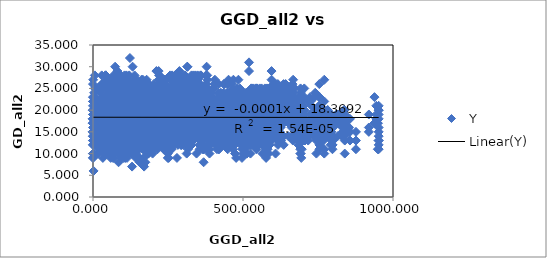
| Category | Y |
|---|---|
| 0.0 | 18 |
| 336.5924377441406 | 18 |
| 336.5924377441406 | 22 |
| 308.39825439453125 | 27 |
| 308.39825439453125 | 19 |
| 30.597917556762695 | 22 |
| 345.9538269042969 | 21 |
| 345.9538269042969 | 24 |
| 33.155311584472656 | 11 |
| 41.821807861328125 | 20 |
| 342.9433898925781 | 24 |
| 342.9433898925781 | 25 |
| 42.73628234863281 | 20 |
| 44.766014099121094 | 27 |
| 11.169123649597168 | 21 |
| 342.9433898925781 | 17 |
| 342.9433898925781 | 21 |
| 42.73628234863281 | 16 |
| 44.766014099121094 | 26 |
| 11.169123649597168 | 21 |
| 0.0 | 17 |
| 611.0723876953125 | 24 |
| 611.0723876953125 | 23 |
| 332.3634948730469 | 24 |
| 360.076904296875 | 28 |
| 352.108154296875 | 23 |
| 362.87445068359375 | 19 |
| 362.87445068359375 | 22 |
| 612.242919921875 | 25 |
| 612.242919921875 | 24 |
| 324.5494384765625 | 23 |
| 353.0105285644531 | 23 |
| 342.62835693359375 | 23 |
| 353.20623779296875 | 21 |
| 353.20623779296875 | 24 |
| 22.39409828186035 | 11 |
| 543.2648315429688 | 18 |
| 543.2648315429688 | 19 |
| 223.1958770751953 | 18 |
| 253.61122131347656 | 25 |
| 233.86766052246094 | 22 |
| 243.43594360351562 | 19 |
| 243.43594360351562 | 19 |
| 142.89517211914062 | 15 |
| 125.56082916259766 | 16 |
| 543.2648315429688 | 17 |
| 543.2648315429688 | 18 |
| 223.1958770751953 | 19 |
| 253.61122131347656 | 20 |
| 233.86766052246094 | 21 |
| 243.43594360351562 | 17 |
| 243.43594360351562 | 17 |
| 142.89517211914062 | 17 |
| 125.56082916259766 | 18 |
| 0.0 | 9 |
| 574.3759765625 | 20 |
| 574.3759765625 | 19 |
| 267.6763610839844 | 20 |
| 297.3863830566406 | 23 |
| 282.14044189453125 | 24 |
| 292.2620849609375 | 18 |
| 292.2620849609375 | 20 |
| 88.31727600097656 | 18 |
| 69.90605926513672 | 15 |
| 55.84099197387695 | 11 |
| 55.84099197387695 | 12 |
| 642.05908203125 | 26 |
| 642.05908203125 | 24 |
| 352.3686218261719 | 22 |
| 381.14630126953125 | 27 |
| 369.4870910644531 | 21 |
| 379.9279479980469 | 19 |
| 379.9279479980469 | 23 |
| 38.350563049316406 | 19 |
| 29.817731857299805 | 21 |
| 146.16342163085938 | 17 |
| 146.16342163085938 | 17 |
| 90.75834655761719 | 19 |
| 608.6643676757812 | 20 |
| 608.6643676757812 | 23 |
| 332.3789367675781 | 21 |
| 359.86883544921875 | 23 |
| 352.5760498046875 | 19 |
| 363.389404296875 | 22 |
| 363.389404296875 | 24 |
| 5.852751731872559 | 17 |
| 27.888471603393555 | 16 |
| 146.00103759765625 | 16 |
| 146.00103759765625 | 16 |
| 91.96529388427734 | 18 |
| 43.5916748046875 | 15 |
| 609.2371215820312 | 26 |
| 609.2371215820312 | 21 |
| 330.4605712890625 | 24 |
| 358.1661682128906 | 28 |
| 350.2300720214844 | 25 |
| 360.99969482421875 | 21 |
| 360.99969482421875 | 25 |
| 1.9184774160385132 | 14 |
| 21.97715950012207 | 18 |
| 141.40292358398438 | 12 |
| 141.40292358398438 | 19 |
| 86.96460723876953 | 17 |
| 39.50728225708008 | 17 |
| 5.912029266357422 | 18 |
| 611.0723876953125 | 22 |
| 611.0723876953125 | 18 |
| 332.3634948730469 | 20 |
| 360.076904296875 | 22 |
| 352.108154296875 | 20 |
| 362.87445068359375 | 19 |
| 362.87445068359375 | 18 |
| 0.0 | 13 |
| 22.39409828186035 | 17 |
| 142.89517211914062 | 9 |
| 142.89517211914062 | 13 |
| 88.31727600097656 | 15 |
| 38.350563049316406 | 13 |
| 5.852751731872559 | 17 |
| 1.9184774160385132 | 6 |
| 572.7981567382812 | 24 |
| 572.7981567382812 | 25 |
| 236.41485595703125 | 23 |
| 265.58087158203125 | 24 |
| 232.62648010253906 | 26 |
| 238.9027099609375 | 26 |
| 238.9027099609375 | 23 |
| 234.3833770751953 | 19 |
| 213.8500518798828 | 20 |
| 101.69757080078125 | 18 |
| 101.69757080078125 | 17 |
| 147.4093780517578 | 21 |
| 226.3685760498047 | 22 |
| 238.55789184570312 | 16 |
| 233.22406005859375 | 20 |
| 234.3833770751953 | 15 |
| 723.70703125 | 19 |
| 723.70703125 | 23 |
| 422.32989501953125 | 20 |
| 452.1468811035156 | 23 |
| 435.5972595214844 | 24 |
| 445.415283203125 | 20 |
| 445.415283203125 | 20 |
| 122.47817993164062 | 16 |
| 113.98316192626953 | 14 |
| 202.3887939453125 | 11 |
| 202.3887939453125 | 14 |
| 154.805419921875 | 15 |
| 85.31163787841797 | 18 |
| 127.00630950927734 | 13 |
| 123.90628051757812 | 16 |
| 122.47817993164062 | 15 |
| 255.14341735839844 | 17 |
| 667.1542358398438 | 27 |
| 667.1542358398438 | 24 |
| 350.2306213378906 | 24 |
| 380.6916198730469 | 28 |
| 359.5654602050781 | 25 |
| 368.7133483886719 | 24 |
| 368.7133483886719 | 25 |
| 122.78584289550781 | 17 |
| 102.06694793701172 | 19 |
| 127.1327896118164 | 12 |
| 127.1327896118164 | 19 |
| 95.36177062988281 | 18 |
| 91.9090347290039 | 16 |
| 128.6338348388672 | 15 |
| 122.97682189941406 | 14 |
| 122.78584289550781 | 12 |
| 166.32110595703125 | 18 |
| 88.96871185302734 | 19 |
| 653.59326171875 | 23 |
| 653.59326171875 | 22 |
| 332.6961975097656 | 23 |
| 363.2550354003906 | 25 |
| 340.6581726074219 | 26 |
| 349.5499267578125 | 21 |
| 349.5499267578125 | 24 |
| 133.3710479736328 | 21 |
| 111.45457458496094 | 20 |
| 110.867431640625 | 18 |
| 110.867431640625 | 18 |
| 88.5773696899414 | 17 |
| 106.9188232421875 | 20 |
| 139.10585021972656 | 15 |
| 133.24636840820312 | 16 |
| 133.3710479736328 | 19 |
| 142.9081573486328 | 20 |
| 112.4687271118164 | 14 |
| 23.50078582763672 | 17 |
| 659.8516235351562 | 20 |
| 659.8516235351562 | 17 |
| 372.1737976074219 | 22 |
| 400.8840637207031 | 25 |
| 389.39813232421875 | 24 |
| 399.84429931640625 | 16 |
| 399.84429931640625 | 21 |
| 50.79468536376953 | 17 |
| 48.46256637573242 | 17 |
| 165.4571533203125 | 13 |
| 165.4571533203125 | 12 |
| 110.3280258178711 | 13 |
| 19.920684814453125 | 17 |
| 54.84035873413086 | 15 |
| 52.400596618652344 | 16 |
| 50.79468536376953 | 14 |
| 242.9273681640625 | 20 |
| 72.61666870117188 | 16 |
| 99.00741577148438 | 16 |
| 116.92588806152344 | 12 |
| 693.3584594726562 | 23 |
| 693.3584594726562 | 22 |
| 437.2178649902344 | 21 |
| 463.622314453125 | 26 |
| 459.00390625 | 23 |
| 469.94384765625 | 22 |
| 469.94384765625 | 21 |
| 110.35126495361328 | 21 |
| 126.72693634033203 | 16 |
| 252.20260620117188 | 9 |
| 252.20260620117188 | 17 |
| 196.63275146484375 | 13 |
| 111.83654022216797 | 23 |
| 108.43370819091797 | 18 |
| 112.04568481445312 | 13 |
| 110.35126495361328 | 12 |
| 337.946533203125 | 22 |
| 134.55880737304688 | 17 |
| 194.45237731933594 | 16 |
| 213.79763793945312 | 19 |
| 97.39913177490234 | 15 |
| 561.1619873046875 | 23 |
| 561.1619873046875 | 23 |
| 229.56080627441406 | 22 |
| 259.9942932128906 | 25 |
| 232.9646453857422 | 26 |
| 241.0638885498047 | 20 |
| 241.0638885498047 | 23 |
| 185.60704040527344 | 20 |
| 165.79302978515625 | 20 |
| 51.640830993652344 | 12 |
| 51.640830993652344 | 17 |
| 97.74112701416016 | 15 |
| 180.89686584472656 | 19 |
| 189.5199432373047 | 20 |
| 184.3520965576172 | 17 |
| 185.60704040527344 | 13 |
| 50.61406707763672 | 19 |
| 220.37039184570312 | 18 |
| 134.38934326171875 | 19 |
| 112.54108428955078 | 17 |
| 198.5774688720703 | 18 |
| 291.4466857910156 | 19 |
| 606.0509643554688 | 22 |
| 606.0509643554688 | 17 |
| 287.7611999511719 | 25 |
| 318.20440673828125 | 22 |
| 297.6218566894531 | 27 |
| 306.94000244140625 | 24 |
| 306.94000244140625 | 23 |
| 116.803955078125 | 20 |
| 94.82061767578125 | 19 |
| 64.62254333496094 | 19 |
| 64.62254333496094 | 16 |
| 45.92457580566406 | 19 |
| 103.64509582519531 | 23 |
| 121.78163146972656 | 15 |
| 116.01081848144531 | 20 |
| 116.803955078125 | 16 |
| 122.98683166503906 | 16 |
| 141.82228088378906 | 19 |
| 62.5103759765625 | 22 |
| 47.83042526245117 | 19 |
| 119.94164276123047 | 15 |
| 215.45645141601562 | 21 |
| 80.38313293457031 | 21 |
| 594.499755859375 | 24 |
| 594.499755859375 | 19 |
| 264.7608642578125 | 24 |
| 295.2781982421875 | 23 |
| 268.955322265625 | 25 |
| 277.1459655761719 | 22 |
| 277.1459655761719 | 23 |
| 170.3186492919922 | 15 |
| 148.8640594482422 | 16 |
| 62.65382385253906 | 10 |
| 62.65382385253906 | 18 |
| 87.86018371582031 | 17 |
| 158.92840576171875 | 20 |
| 174.95962524414062 | 17 |
| 169.35304260253906 | 9 |
| 170.3186492919922 | 7 |
| 68.38549041748047 | 20 |
| 188.548828125 | 16 |
| 100.72956085205078 | 15 |
| 78.03026580810547 | 20 |
| 174.94383239746094 | 13 |
| 270.7470397949219 | 12 |
| 36.168548583984375 | 16 |
| 55.29109573364258 | 15 |
| 553.73828125 | 18 |
| 553.73828125 | 20 |
| 222.66285705566406 | 18 |
| 253.142333984375 | 25 |
| 226.6779327392578 | 21 |
| 234.93324279785156 | 20 |
| 234.93324279785156 | 18 |
| 184.12232971191406 | 16 |
| 164.7902069091797 | 17 |
| 46.809879302978516 | 10 |
| 46.809879302978516 | 11 |
| 95.88984680175781 | 13 |
| 181.04295349121094 | 16 |
| 187.85281372070312 | 14 |
| 182.80784606933594 | 13 |
| 184.12232971191406 | 10 |
| 54.909488677978516 | 16 |
| 223.3858184814453 | 16 |
| 138.3961944580078 | 12 |
| 117.03437805175781 | 16 |
| 199.08770751953125 | 12 |
| 290.95013427734375 | 15 |
| 7.8460612297058105 | 17 |
| 82.35458374023438 | 14 |
| 42.3043327331543 | 14 |
| 570.0089111328125 | 23 |
| 570.0089111328125 | 21 |
| 257.1239318847656 | 21 |
| 287.22308349609375 | 24 |
| 269.7819519042969 | 27 |
| 279.63177490234375 | 20 |
| 279.63177490234375 | 21 |
| 107.9359130859375 | 19 |
| 89.02912902832031 | 19 |
| 38.350528717041016 | 10 |
| 38.350528717041016 | 16 |
| 19.734533309936523 | 14 |
| 108.06942749023438 | 18 |
| 111.66101837158203 | 18 |
| 106.61154174804688 | 14 |
| 107.9359130859375 | 9 |
| 127.79035949707031 | 17 |
| 165.81735229492188 | 15 |
| 97.15308380126953 | 13 |
| 85.7076416015625 | 20 |
| 127.22042846679688 | 17 |
| 215.66665649414062 | 16 |
| 78.01134490966797 | 13 |
| 38.43940353393555 | 18 |
| 70.08003997802734 | 9 |
| 76.19879913330078 | 14 |
| 609.5515747070312 | 25 |
| 609.5515747070312 | 25 |
| 291.5254821777344 | 20 |
| 321.9632263183594 | 25 |
| 301.4199523925781 | 24 |
| 310.73956298828125 | 26 |
| 310.73956298828125 | 27 |
| 115.56438446044922 | 20 |
| 93.44818115234375 | 19 |
| 68.36766052246094 | 15 |
| 68.36766052246094 | 21 |
| 47.49314498901367 | 16 |
| 101.3092041015625 | 24 |
| 120.63333892822266 | 19 |
| 114.82595825195312 | 15 |
| 115.56438446044922 | 15 |
| 125.67058563232422 | 24 |
| 138.1477813720703 | 17 |
| 58.77418899536133 | 18 |
| 44.56229782104492 | 22 |
| 117.30209350585938 | 20 |
| 213.14569091796875 | 16 |
| 83.69881439208984 | 19 |
| 3.799713373184204 | 23 |
| 57.6868782043457 | 13 |
| 85.8255615234375 | 19 |
| 41.31404495239258 | 13 |
| 653.0517578125 | 24 |
| 653.0517578125 | 21 |
| 323.88702392578125 | 21 |
| 354.39361572265625 | 24 |
| 327.5762939453125 | 23 |
| 335.54754638671875 | 19 |
| 335.54754638671875 | 22 |
| 174.41783142089844 | 18 |
| 152.091796875 | 16 |
| 113.77238464355469 | 11 |
| 113.77238464355469 | 16 |
| 113.2616195678711 | 16 |
| 150.74114990234375 | 15 |
| 179.9801788330078 | 16 |
| 174.06893920898438 | 12 |
| 174.41783142089844 | 8 |
| 110.60018157958984 | 17 |
| 152.1744842529297 | 16 |
| 65.85067749023438 | 14 |
| 44.69692611694336 | 20 |
| 161.51528930664062 | 15 |
| 258.4888916015625 | 11 |
| 94.66969299316406 | 11 |
| 67.37959289550781 | 18 |
| 59.138790130615234 | 9 |
| 101.28446197509766 | 15 |
| 102.85202026367188 | 9 |
| 66.23735046386719 | 12 |
| 570.0089111328125 | 20 |
| 570.0089111328125 | 18 |
| 257.1239318847656 | 21 |
| 287.22308349609375 | 22 |
| 269.7819519042969 | 25 |
| 279.63177490234375 | 16 |
| 279.63177490234375 | 20 |
| 107.9359130859375 | 15 |
| 89.02912902832031 | 16 |
| 38.350528717041016 | 10 |
| 38.350528717041016 | 12 |
| 19.734533309936523 | 14 |
| 108.06942749023438 | 13 |
| 111.66101837158203 | 15 |
| 106.61154174804688 | 12 |
| 107.9359130859375 | 11 |
| 127.79035949707031 | 18 |
| 165.81735229492188 | 11 |
| 97.15308380126953 | 17 |
| 85.7076416015625 | 16 |
| 127.22042846679688 | 12 |
| 215.66665649414062 | 18 |
| 78.01134490966797 | 15 |
| 38.43940353393555 | 15 |
| 70.08003997802734 | 10 |
| 76.19879913330078 | 12 |
| 0.0 | 9 |
| 41.31404495239258 | 16 |
| 102.85202026367188 | 13 |
| 589.0814208984375 | 18 |
| 589.0814208984375 | 19 |
| 259.00091552734375 | 19 |
| 289.5057067871094 | 28 |
| 263.0496520996094 | 23 |
| 271.2200622558594 | 19 |
| 271.2200622558594 | 19 |
| 172.63613891601562 | 16 |
| 151.41151428222656 | 17 |
| 59.69709777832031 | 10 |
| 59.69709777832031 | 10 |
| 88.79448699951172 | 16 |
| 162.39878845214844 | 18 |
| 177.16160583496094 | 17 |
| 171.61769104003906 | 17 |
| 172.63613891601562 | 13 |
| 64.22086334228516 | 21 |
| 193.80580139160156 | 15 |
| 106.25639343261719 | 19 |
| 83.69831085205078 | 22 |
| 178.7398681640625 | 16 |
| 274.14044189453125 | 15 |
| 30.2147216796875 | 18 |
| 58.8289680480957 | 16 |
| 5.9598708152771 | 18 |
| 36.440006256103516 | 12 |
| 70.42095947265625 | 17 |
| 61.45502471923828 | 21 |
| 64.88789367675781 | 13 |
| 70.42095947265625 | 12 |
| 646.7122802734375 | 22 |
| 646.7122802734375 | 21 |
| 318.61297607421875 | 24 |
| 349.16290283203125 | 27 |
| 323.05474853515625 | 26 |
| 331.2064208984375 | 23 |
| 331.2064208984375 | 22 |
| 166.38294982910156 | 17 |
| 144.02220153808594 | 18 |
| 106.20567321777344 | 15 |
| 106.20567321777344 | 18 |
| 104.39730072021484 | 16 |
| 143.57568359375 | 21 |
| 171.9049835205078 | 18 |
| 165.99302673339844 | 15 |
| 166.38294982910156 | 15 |
| 110.0492172241211 | 19 |
| 149.05198669433594 | 19 |
| 61.260223388671875 | 17 |
| 38.88872146606445 | 17 |
| 154.9583740234375 | 15 |
| 252.1632080078125 | 16 |
| 90.14495849609375 | 21 |
| 58.5109977722168 | 14 |
| 54.10598373413086 | 14 |
| 96.40737915039062 | 10 |
| 94.15133666992188 | 18 |
| 57.37913131713867 | 22 |
| 8.8689603805542 | 18 |
| 94.15133666992188 | 15 |
| 60.005123138427734 | 16 |
| 580.0127563476562 | 22 |
| 580.0127563476562 | 25 |
| 250.57498168945312 | 21 |
| 281.1150817871094 | 28 |
| 255.25814819335938 | 24 |
| 263.5881652832031 | 18 |
| 263.5881652832031 | 19 |
| 169.8580780029297 | 17 |
| 149.07627868652344 | 20 |
| 50.88556671142578 | 16 |
| 50.88556671142578 | 17 |
| 84.2339859008789 | 17 |
| 161.71243286132812 | 20 |
| 174.1832275390625 | 20 |
| 168.75450134277344 | 22 |
| 169.8580780029297 | 18 |
| 64.89379119873047 | 23 |
| 197.2684326171875 | 20 |
| 110.8101806640625 | 20 |
| 88.88898468017578 | 16 |
| 178.66456604003906 | 18 |
| 273.1334228515625 | 21 |
| 23.65210723876953 | 15 |
| 59.01826095581055 | 21 |
| 14.493782997131348 | 20 |
| 28.724950790405273 | 15 |
| 65.19802856445312 | 17 |
| 62.043338775634766 | 22 |
| 73.44851684570312 | 18 |
| 65.19802856445312 | 17 |
| 9.518770217895508 | 19 |
| 68.06269073486328 | 14 |
| 570.0089111328125 | 20 |
| 570.0089111328125 | 21 |
| 257.1239318847656 | 22 |
| 287.22308349609375 | 23 |
| 269.7819519042969 | 24 |
| 279.63177490234375 | 18 |
| 279.63177490234375 | 21 |
| 107.9359130859375 | 12 |
| 89.02912902832031 | 15 |
| 38.350528717041016 | 14 |
| 38.350528717041016 | 17 |
| 19.734533309936523 | 13 |
| 108.06942749023438 | 17 |
| 111.66101837158203 | 13 |
| 106.61154174804688 | 14 |
| 107.9359130859375 | 14 |
| 127.79035949707031 | 16 |
| 165.81735229492188 | 15 |
| 97.15308380126953 | 18 |
| 85.7076416015625 | 19 |
| 127.22042846679688 | 14 |
| 215.66665649414062 | 16 |
| 78.01134490966797 | 15 |
| 38.43940353393555 | 15 |
| 70.08003997802734 | 14 |
| 76.19879913330078 | 15 |
| 0.0 | 17 |
| 41.31404495239258 | 20 |
| 102.85202026367188 | 15 |
| 0.0 | 15 |
| 70.42095947265625 | 16 |
| 94.15133666992188 | 12 |
| 65.19802856445312 | 19 |
| 635.2426147460938 | 26 |
| 635.2426147460938 | 21 |
| 322.1102294921875 | 25 |
| 352.3760070800781 | 20 |
| 333.29058837890625 | 22 |
| 342.8126220703125 | 19 |
| 342.8126220703125 | 20 |
| 99.09312438964844 | 19 |
| 76.9604263305664 | 16 |
| 99.43075561523438 | 15 |
| 99.43075561523438 | 15 |
| 61.907997131347656 | 16 |
| 75.82059478759766 | 18 |
| 104.76040649414062 | 18 |
| 98.8694839477539 | 16 |
| 99.09312438964844 | 12 |
| 156.7611846923828 | 20 |
| 104.47672271728516 | 19 |
| 33.75407028198242 | 19 |
| 34.840328216552734 | 20 |
| 88.91642761230469 | 17 |
| 186.2243194580078 | 14 |
| 117.10171508789062 | 20 |
| 37.38433074951172 | 16 |
| 88.40125274658203 | 12 |
| 119.50394439697266 | 16 |
| 65.84796142578125 | 17 |
| 33.76450729370117 | 22 |
| 75.76177978515625 | 16 |
| 65.84796142578125 | 15 |
| 92.93107604980469 | 18 |
| 68.14555358886719 | 14 |
| 94.7896957397461 | 21 |
| 65.84796142578125 | 13 |
| 607.6777954101562 | 23 |
| 607.6777954101562 | 20 |
| 272.611328125 | 21 |
| 302.4283447265625 | 23 |
| 271.41180419921875 | 22 |
| 278.2763366699219 | 14 |
| 278.2763366699219 | 20 |
| 213.61000061035156 | 14 |
| 191.84727478027344 | 12 |
| 100.17379760742188 | 14 |
| 100.17379760742188 | 12 |
| 132.00807189941406 | 12 |
| 199.67462158203125 | 19 |
| 218.40101623535156 | 18 |
| 212.7199249267578 | 19 |
| 213.61000061035156 | 16 |
| 42.456417083740234 | 21 |
| 218.36111450195312 | 14 |
| 129.5347900390625 | 20 |
| 106.09349822998047 | 19 |
| 214.4380340576172 | 15 |
| 311.3235168457031 | 16 |
| 53.675758361816406 | 16 |
| 97.16362762451172 | 18 |
| 44.166587829589844 | 18 |
| 61.35895538330078 | 14 |
| 113.96250915527344 | 17 |
| 98.92198944091797 | 20 |
| 69.4442367553711 | 15 |
| 113.96250915527344 | 11 |
| 43.61764144897461 | 11 |
| 70.15608978271484 | 19 |
| 50.36499786376953 | 17 |
| 113.96250915527344 | 16 |
| 125.8056869506836 | 16 |
| 525.6075439453125 | 20 |
| 525.6075439453125 | 21 |
| 205.86087036132812 | 20 |
| 236.21942138671875 | 24 |
| 217.242919921875 | 23 |
| 226.9675750732422 | 21 |
| 226.9675750732422 | 20 |
| 151.861083984375 | 18 |
| 136.13499450683594 | 15 |
| 17.73990249633789 | 12 |
| 17.73990249633789 | 15 |
| 67.98746490478516 | 12 |
| 158.6945037841797 | 21 |
| 154.4351806640625 | 17 |
| 150.2509307861328 | 12 |
| 151.861083984375 | 11 |
| 105.15824127197266 | 21 |
| 218.47584533691406 | 13 |
| 144.68292236328125 | 19 |
| 128.60598754882812 | 18 |
| 178.31126403808594 | 16 |
| 262.0119323730469 | 11 |
| 58.06940460205078 | 20 |
| 82.18962860107422 | 18 |
| 76.68650817871094 | 11 |
| 51.51184844970703 | 15 |
| 52.91740798950195 | 14 |
| 85.91063690185547 | 11 |
| 130.3748779296875 | 13 |
| 52.91740798950195 | 14 |
| 72.90557861328125 | 16 |
| 123.04930877685547 | 16 |
| 63.5572395324707 | 18 |
| 52.91740798950195 | 17 |
| 116.36531829833984 | 16 |
| 110.27876281738281 | 15 |
| 651.5767822265625 | 25 |
| 651.5767822265625 | 22 |
| 326.6238708496094 | 24 |
| 357.2212829589844 | 26 |
| 332.736083984375 | 25 |
| 341.24658203125 | 22 |
| 341.24658203125 | 23 |
| 151.1294708251953 | 18 |
| 128.92478942871094 | 16 |
| 108.57020568847656 | 14 |
| 108.57020568847656 | 19 |
| 96.83658599853516 | 17 |
| 126.39307403564453 | 21 |
| 156.77162170410156 | 21 |
| 150.87193298339844 | 14 |
| 151.1294708251953 | 13 |
| 126.43389129638672 | 23 |
| 130.6720428466797 | 16 |
| 42.485984802246094 | 19 |
| 20.26102066040039 | 21 |
| 136.9917449951172 | 21 |
| 233.9896240234375 | 14 |
| 101.18968200683594 | 16 |
| 51.77055358886719 | 20 |
| 65.26911163330078 | 12 |
| 106.6317138671875 | 16 |
| 89.88280487060547 | 15 |
| 49.55082321166992 | 15 |
| 24.523605346679688 | 13 |
| 89.88280487060547 | 12 |
| 71.19898223876953 | 14 |
| 18.805984497070312 | 16 |
| 77.91400909423828 | 21 |
| 89.88280487060547 | 16 |
| 52.06651306152344 | 12 |
| 87.85272979736328 | 12 |
| 126.08879089355469 | 16 |
| 289.9646301269531 | 23 |
| 289.9646301269531 | 18 |
| 119.6859130859375 | 21 |
| 96.41453552246094 | 25 |
| 99.76162719726562 | 24 |
| 89.74176788330078 | 19 |
| 89.74176788330078 | 20 |
| 450.8919982910156 | 16 |
| 442.0020446777344 | 15 |
| 333.1093444824219 | 13 |
| 333.1093444824219 | 17 |
| 381.8962097167969 | 14 |
| 469.0888366699219 | 16 |
| 451.14495849609375 | 16 |
| 449.00128173828125 | 11 |
| 450.8919982910156 | 13 |
| 321.48480224609375 | 18 |
| 535.1554565429688 | 17 |
| 457.9532775878906 | 15 |
| 438.425048828125 | 17 |
| 488.9897155761719 | 13 |
| 556.66064453125 | 13 |
| 328.6156005859375 | 18 |
| 396.40380859375 | 17 |
| 364.78387451171875 | 11 |
| 322.8314208984375 | 14 |
| 369.37322998046875 | 16 |
| 400.2032775878906 | 19 |
| 422.52337646484375 | 15 |
| 369.37322998046875 | 12 |
| 358.8301086425781 | 14 |
| 418.6270751953125 | 11 |
| 351.55548095703125 | 19 |
| 369.37322998046875 | 11 |
| 432.4387512207031 | 12 |
| 362.3876037597656 | 16 |
| 316.6993713378906 | 11 |
| 429.4329833984375 | 14 |
| 704.2862548828125 | 25 |
| 704.2862548828125 | 23 |
| 442.1230163574219 | 21 |
| 469.0804443359375 | 22 |
| 462.9532470703125 | 23 |
| 473.803466796875 | 19 |
| 473.803466796875 | 24 |
| 111.55754089355469 | 19 |
| 125.5006103515625 | 14 |
| 250.82630920410156 | 16 |
| 250.82630920410156 | 19 |
| 194.99649047851562 | 17 |
| 106.99103546142578 | 18 |
| 110.53520202636719 | 17 |
| 113.3713150024414 | 16 |
| 111.55754089355469 | 14 |
| 333.1778259277344 | 13 |
| 119.79439544677734 | 18 |
| 184.6762237548828 | 16 |
| 204.95989990234375 | 19 |
| 90.51968383789062 | 19 |
| 17.497316360473633 | 17 |
| 287.8363037109375 | 17 |
| 210.23623657226562 | 18 |
| 265.3750915527344 | 14 |
| 287.804931640625 | 16 |
| 213.51991271972656 | 13 |
| 207.69525146484375 | 17 |
| 249.60205078125 | 10 |
| 213.51991271972656 | 15 |
| 269.065185546875 | 18 |
| 243.6640625 | 17 |
| 268.6473693847656 | 18 |
| 213.51991271972656 | 18 |
| 179.17018127441406 | 17 |
| 304.88531494140625 | 17 |
| 261.619140625 | 17 |
| 225.21905517578125 | 14 |
| 561.2374267578125 | 16 |
| 605.0715942382812 | 24 |
| 605.0715942382812 | 20 |
| 325.7366943359375 | 23 |
| 353.4583740234375 | 23 |
| 345.4945983886719 | 23 |
| 356.26470947265625 | 20 |
| 356.26470947265625 | 19 |
| 6.627439975738525 | 17 |
| 20.719097137451172 | 17 |
| 137.23348999023438 | 14 |
| 137.23348999023438 | 16 |
| 83.0942153930664 | 14 |
| 41.86090850830078 | 18 |
| 8.875386238098145 | 18 |
| 4.735645771026611 | 17 |
| 6.627439975738525 | 13 |
| 229.70846557617188 | 23 |
| 126.81713104248047 | 18 |
| 122.6402587890625 | 20 |
| 132.128173828125 | 21 |
| 55.90811538696289 | 15 |
| 116.59626007080078 | 15 |
| 180.64576721191406 | 19 |
| 113.33856201171875 | 18 |
| 166.2671661376953 | 14 |
| 178.98023986816406 | 14 |
| 102.7870864868164 | 16 |
| 112.27942657470703 | 18 |
| 172.38946533203125 | 14 |
| 102.7870864868164 | 12 |
| 168.41574096679688 | 16 |
| 164.22068786621094 | 17 |
| 165.369873046875 | 17 |
| 102.7870864868164 | 16 |
| 97.55188751220703 | 17 |
| 209.7883758544922 | 12 |
| 145.86453247070312 | 11 |
| 149.421875 | 16 |
| 444.26739501953125 | 12 |
| 118.06781768798828 | 18 |
| 724.9541015625 | 22 |
| 724.9541015625 | 15 |
| 435.760009765625 | 26 |
| 464.8211975097656 | 25 |
| 451.76251220703125 | 27 |
| 462.0108947753906 | 24 |
| 462.0108947753906 | 19 |
| 114.22824096679688 | 22 |
| 113.76560974121094 | 22 |
| 222.6132354736328 | 14 |
| 222.6132354736328 | 17 |
| 169.9840545654297 | 20 |
| 84.33038330078125 | 19 |
| 117.212890625 | 19 |
| 116.01203918457031 | 17 |
| 114.22824096679688 | 12 |
| 287.0026550292969 | 22 |
| 42.73221969604492 | 20 |
| 123.97755432128906 | 18 |
| 146.98052978515625 | 21 |
| 65.39591979980469 | 15 |
| 94.92545318603516 | 19 |
| 248.0193634033203 | 18 |
| 167.69546508789062 | 15 |
| 218.9905242919922 | 12 |
| 249.9898681640625 | 16 |
| 184.4859619140625 | 13 |
| 164.32559204101562 | 20 |
| 189.40333557128906 | 11 |
| 184.4859619140625 | 14 |
| 223.77923583984375 | 16 |
| 185.2286834716797 | 19 |
| 225.8919677734375 | 20 |
| 184.4859619140625 | 18 |
| 131.10247802734375 | 16 |
| 252.697998046875 | 19 |
| 237.16978454589844 | 18 |
| 166.46353149414062 | 16 |
| 551.5101928710938 | 16 |
| 79.01498413085938 | 18 |
| 120.02198791503906 | 16 |
| 308.1032409667969 | 20 |
| 308.1032409667969 | 23 |
| 100.87713623046875 | 23 |
| 81.37201690673828 | 26 |
| 77.74834442138672 | 26 |
| 67.24243927001953 | 21 |
| 67.24243927001953 | 22 |
| 429.7846374511719 | 20 |
| 420.3728942871094 | 14 |
| 310.0333557128906 | 16 |
| 310.0333557128906 | 15 |
| 359.42218017578125 | 17 |
| 447.16339111328125 | 19 |
| 430.1936340332031 | 17 |
| 427.9031982421875 | 23 |
| 429.7846374511719 | 18 |
| 297.4061584472656 | 19 |
| 512.2550048828125 | 15 |
| 434.4705810546875 | 22 |
| 414.7928771972656 | 19 |
| 467.0787048339844 | 14 |
| 536.3073120117188 | 19 |
| 304.7280578613281 | 20 |
| 373.07720947265625 | 16 |
| 340.89605712890625 | 20 |
| 299.0003356933594 | 15 |
| 346.5584716796875 | 20 |
| 376.87554931640625 | 25 |
| 398.5430908203125 | 19 |
| 346.5584716796875 | 14 |
| 334.94012451171875 | 15 |
| 394.69622802734375 | 18 |
| 327.72515869140625 | 20 |
| 346.5584716796875 | 15 |
| 409.2636413574219 | 20 |
| 338.2978210449219 | 15 |
| 293.7820739746094 | 21 |
| 405.6218566894531 | 17 |
| 24.089969635009766 | 18 |
| 540.4954223632812 | 16 |
| 423.1675720214844 | 15 |
| 529.2259521484375 | 22 |
| 632.2920532226562 | 21 |
| 632.2920532226562 | 22 |
| 318.25933837890625 | 23 |
| 348.5621643066406 | 27 |
| 329.18731689453125 | 25 |
| 338.6674499511719 | 27 |
| 338.6674499511719 | 23 |
| 101.77978515625 | 23 |
| 79.51608276367188 | 22 |
| 95.37606048583984 | 19 |
| 95.37606048583984 | 16 |
| 59.78857421875 | 20 |
| 79.70125579833984 | 23 |
| 107.38678741455078 | 16 |
| 101.48096466064453 | 23 |
| 101.77978515625 | 19 |
| 152.04139709472656 | 20 |
| 109.04631805419922 | 21 |
| 35.58433151245117 | 25 |
| 33.41533660888672 | 18 |
| 93.22383880615234 | 19 |
| 190.45016479492188 | 18 |
| 112.35050964355469 | 21 |
| 32.77627182006836 | 16 |
| 83.67186737060547 | 22 |
| 114.79032897949219 | 17 |
| 62.51683807373047 | 24 |
| 29.11825180053711 | 26 |
| 72.70023345947266 | 22 |
| 62.51683807373047 | 20 |
| 88.17868041992188 | 14 |
| 64.86341094970703 | 18 |
| 90.01947021484375 | 21 |
| 62.51683807373047 | 17 |
| 4.770721435546875 | 19 |
| 121.33746337890625 | 20 |
| 112.43614959716797 | 20 |
| 49.44524383544922 | 21 |
| 428.26409912109375 | 19 |
| 183.5722198486328 | 23 |
| 99.9792251586914 | 21 |
| 135.87290954589844 | 22 |
| 405.0535583496094 | 18 |
| 676.513916015625 | 20 |
| 676.513916015625 | 20 |
| 352.9137268066406 | 21 |
| 383.51080322265625 | 21 |
| 359.3475036621094 | 25 |
| 367.89605712890625 | 20 |
| 367.89605712890625 | 19 |
| 153.79714965820312 | 21 |
| 132.52757263183594 | 17 |
| 133.25343322753906 | 13 |
| 133.25343322753906 | 10 |
| 113.99483489990234 | 12 |
| 123.88462829589844 | 20 |
| 159.6219024658203 | 16 |
| 153.87339782714844 | 20 |
| 153.79714965820312 | 15 |
| 150.94129943847656 | 15 |
| 111.48706817626953 | 15 |
| 32.03303909301758 | 16 |
| 25.42270278930664 | 15 |
| 130.84878540039062 | 13 |
| 225.5166015625 | 16 |
| 127.85063934326172 | 19 |
| 72.24004364013672 | 16 |
| 91.8514633178711 | 18 |
| 133.32736206054688 | 12 |
| 110.53080749511719 | 15 |
| 69.2192611694336 | 21 |
| 41.70465850830078 | 17 |
| 110.53080749511719 | 13 |
| 97.79638671875 | 18 |
| 40.89262008666992 | 17 |
| 104.60874938964844 | 18 |
| 110.53080749511719 | 16 |
| 58.15249252319336 | 18 |
| 110.72018432617188 | 17 |
| 150.935546875 | 17 |
| 26.69574737548828 | 20 |
| 456.12481689453125 | 17 |
| 215.1175537109375 | 18 |
| 153.22860717773438 | 18 |
| 150.267333984375 | 17 |
| 432.3166198730469 | 14 |
| 57.66340637207031 | 20 |
| 577.3297729492188 | 24 |
| 577.3297729492188 | 19 |
| 241.0909881591797 | 27 |
| 270.3910217285156 | 27 |
| 237.78981018066406 | 27 |
| 244.18377685546875 | 25 |
| 244.18377685546875 | 20 |
| 230.5709686279297 | 26 |
| 209.85601806640625 | 23 |
| 99.80443572998047 | 19 |
| 99.80443572998047 | 16 |
| 144.03265380859375 | 19 |
| 221.8399658203125 | 23 |
| 234.82733154296875 | 22 |
| 229.44293212890625 | 25 |
| 230.5709686279297 | 20 |
| 6.048202991485596 | 28 |
| 249.53648376464844 | 24 |
| 160.66403198242188 | 26 |
| 137.22511291503906 | 22 |
| 238.21044921875 | 19 |
| 333.5183410644531 | 20 |
| 48.27854537963867 | 21 |
| 118.31144714355469 | 20 |
| 63.400550842285156 | 22 |
| 53.27190399169922 | 19 |
| 124.50663757324219 | 24 |
| 120.91043090820312 | 28 |
| 104.58120727539062 | 21 |
| 124.50663757324219 | 20 |
| 59.482635498046875 | 16 |
| 104.0997085571289 | 16 |
| 60.779850006103516 | 15 |
| 124.50663757324219 | 22 |
| 151.65745544433594 | 19 |
| 36.443355560302734 | 18 |
| 104.2557144165039 | 19 |
| 120.58959197998047 | 23 |
| 327.09051513671875 | 18 |
| 328.5474853515625 | 24 |
| 225.9936981201172 | 17 |
| 281.6666564941406 | 17 |
| 303.0071105957031 | 22 |
| 146.95367431640625 | 17 |
| 144.99208068847656 | 22 |
| 624.632568359375 | 25 |
| 624.632568359375 | 21 |
| 289.6075134277344 | 23 |
| 316.48602294921875 | 27 |
| 278.97332763671875 | 25 |
| 282.99981689453125 | 17 |
| 282.99981689453125 | 22 |
| 294.95941162109375 | 19 |
| 273.1996765136719 | 20 |
| 173.02337646484375 | 15 |
| 173.02337646484375 | 17 |
| 212.1863555908203 | 16 |
| 280.30645751953125 | 23 |
| 299.7294616699219 | 21 |
| 294.06048583984375 | 21 |
| 294.95941162109375 | 19 |
| 73.95741271972656 | 25 |
| 290.5296936035156 | 21 |
| 203.92404174804688 | 23 |
| 181.36500549316406 | 16 |
| 294.32977294921875 | 17 |
| 391.58514404296875 | 22 |
| 121.45421600341797 | 15 |
| 178.46751403808594 | 22 |
| 124.99163818359375 | 20 |
| 127.1347885131836 | 20 |
| 193.43992614746094 | 20 |
| 180.12472534179688 | 26 |
| 138.53855895996094 | 21 |
| 193.43992614746094 | 17 |
| 123.45052337646484 | 20 |
| 142.6842803955078 | 22 |
| 128.28355407714844 | 20 |
| 193.43992614746094 | 17 |
| 205.41334533691406 | 22 |
| 81.35597229003906 | 19 |
| 178.3921356201172 | 22 |
| 161.4877166748047 | 23 |
| 356.3956298828125 | 20 |
| 384.439208984375 | 23 |
| 291.0962829589844 | 19 |
| 327.8313903808594 | 21 |
| 332.94189453125 | 19 |
| 201.14047241210938 | 19 |
| 179.16244506835938 | 17 |
| 74.17814636230469 | 20 |
| 308.1032409667969 | 25 |
| 308.1032409667969 | 23 |
| 100.87713623046875 | 23 |
| 81.37201690673828 | 29 |
| 77.74834442138672 | 28 |
| 67.24243927001953 | 19 |
| 67.24243927001953 | 25 |
| 429.7846374511719 | 23 |
| 420.3728942871094 | 21 |
| 310.0333557128906 | 18 |
| 310.0333557128906 | 20 |
| 359.42218017578125 | 17 |
| 447.16339111328125 | 24 |
| 430.1936340332031 | 20 |
| 427.9031982421875 | 22 |
| 429.7846374511719 | 22 |
| 297.4061584472656 | 23 |
| 512.2550048828125 | 22 |
| 434.4705810546875 | 22 |
| 414.7928771972656 | 15 |
| 467.0787048339844 | 17 |
| 536.3073120117188 | 16 |
| 304.7280578613281 | 18 |
| 373.07720947265625 | 19 |
| 340.89605712890625 | 21 |
| 299.0003356933594 | 19 |
| 346.5584716796875 | 21 |
| 376.87554931640625 | 26 |
| 398.5430908203125 | 20 |
| 346.5584716796875 | 17 |
| 334.94012451171875 | 18 |
| 394.69622802734375 | 19 |
| 327.72515869140625 | 19 |
| 346.5584716796875 | 19 |
| 409.2636413574219 | 21 |
| 338.2978210449219 | 15 |
| 293.7820739746094 | 21 |
| 405.6218566894531 | 20 |
| 24.089969635009766 | 17 |
| 540.4954223632812 | 18 |
| 423.1675720214844 | 22 |
| 529.2259521484375 | 24 |
| 0.0 | 20 |
| 405.0535583496094 | 17 |
| 432.3166198730469 | 18 |
| 303.0071105957031 | 19 |
| 332.94189453125 | 18 |
| 754.3591918945312 | 23 |
| 754.3591918945312 | 23 |
| 455.0025329589844 | 24 |
| 484.7658996582031 | 21 |
| 468.41375732421875 | 23 |
| 478.2410583496094 | 18 |
| 478.2410583496094 | 23 |
| 148.3187255859375 | 21 |
| 142.7567596435547 | 17 |
| 235.20913696289062 | 19 |
| 235.20913696289062 | 15 |
| 187.38137817382812 | 17 |
| 113.19035339355469 | 21 |
| 152.23812866210938 | 19 |
| 149.9208984375 | 21 |
| 148.3187255859375 | 18 |
| 285.5185241699219 | 20 |
| 32.831363677978516 | 16 |
| 119.2886734008789 | 24 |
| 142.62008666992188 | 18 |
| 97.52442169189453 | 16 |
| 136.7212371826172 | 20 |
| 252.2563934326172 | 21 |
| 174.3083038330078 | 21 |
| 219.75401306152344 | 19 |
| 255.4943389892578 | 18 |
| 198.63182067871094 | 20 |
| 170.60543823242188 | 22 |
| 179.9371795654297 | 15 |
| 198.63182067871094 | 16 |
| 225.14097595214844 | 18 |
| 177.6800994873047 | 22 |
| 228.98504638671875 | 22 |
| 198.63182067871094 | 20 |
| 137.0381622314453 | 18 |
| 247.63380432128906 | 13 |
| 251.30638122558594 | 18 |
| 159.80015563964844 | 17 |
| 567.9818115234375 | 21 |
| 120.04975891113281 | 15 |
| 153.33436584472656 | 17 |
| 43.33876037597656 | 19 |
| 545.0861206054688 | 17 |
| 141.55538940429688 | 23 |
| 138.41897583007812 | 16 |
| 279.81097412109375 | 25 |
| 317.2491149902344 | 23 |
| 545.0861206054688 | 20 |
| 607.6685180664062 | 18 |
| 607.6685180664062 | 16 |
| 271.20660400390625 | 25 |
| 299.3748779296875 | 26 |
| 263.9395446777344 | 28 |
| 269.0925598144531 | 22 |
| 269.0925598144531 | 17 |
| 262.7563781738281 | 21 |
| 241.20477294921875 | 22 |
| 139.54881286621094 | 21 |
| 139.54881286621094 | 16 |
| 179.04940795898438 | 19 |
| 249.6233673095703 | 20 |
| 267.4122314453125 | 17 |
| 261.8009948730469 | 20 |
| 262.7563781738281 | 18 |
| 42.51203536987305 | 21 |
| 265.5074157714844 | 20 |
| 177.37942504882812 | 24 |
| 154.2218017578125 | 19 |
| 264.375 | 15 |
| 361.2877502441406 | 24 |
| 88.05165100097656 | 20 |
| 146.8149871826172 | 17 |
| 92.45269775390625 | 19 |
| 93.93397521972656 | 16 |
| 160.15069580078125 | 18 |
| 148.70887756347656 | 22 |
| 113.72010040283203 | 18 |
| 160.15069580078125 | 13 |
| 90.51963806152344 | 19 |
| 116.4676284790039 | 19 |
| 94.95409393310547 | 20 |
| 160.15069580078125 | 17 |
| 175.65562438964844 | 20 |
| 49.96431350708008 | 17 |
| 145.35658264160156 | 20 |
| 135.01129150390625 | 19 |
| 347.3312072753906 | 18 |
| 354.7940368652344 | 21 |
| 258.7175598144531 | 17 |
| 301.201171875 | 12 |
| 323.4615478515625 | 18 |
| 171.22364807128906 | 21 |
| 155.3275604248047 | 17 |
| 41.651180267333984 | 21 |
| 33.55664825439453 | 22 |
| 323.4615478515625 | 24 |
| 293.6569519042969 | 19 |
| 595.1511840820312 | 29 |
| 595.1511840820312 | 27 |
| 265.3681640625 | 25 |
| 295.88299560546875 | 24 |
| 269.5196533203125 | 26 |
| 277.69940185546875 | 24 |
| 277.69940185546875 | 28 |
| 170.55332946777344 | 19 |
| 149.07289123535156 | 19 |
| 63.310821533203125 | 19 |
| 63.310821533203125 | 17 |
| 88.25218200683594 | 17 |
| 159.0155792236328 | 19 |
| 175.2074737548828 | 25 |
| 169.59397888183594 | 25 |
| 170.55332946777344 | 21 |
| 68.4387435913086 | 28 |
| 188.32183837890625 | 23 |
| 100.43809509277344 | 25 |
| 77.69757080078125 | 27 |
| 174.98255920410156 | 22 |
| 270.84014892578125 | 26 |
| 36.69731140136719 | 21 |
| 55.39012908935547 | 27 |
| 0.6828659772872925 | 27 |
| 42.88227462768555 | 22 |
| 70.53086853027344 | 25 |
| 57.75035858154297 | 20 |
| 58.52542495727539 | 23 |
| 70.53086853027344 | 21 |
| 6.483785629272461 | 19 |
| 53.53676223754883 | 27 |
| 15.152195930480957 | 25 |
| 70.53086853027344 | 20 |
| 88.32923889160156 | 26 |
| 43.80036926269531 | 16 |
| 77.36444091796875 | 25 |
| 64.8138427734375 | 26 |
| 365.3119201660156 | 24 |
| 265.426025390625 | 25 |
| 166.52174377441406 | 21 |
| 218.86070251464844 | 27 |
| 341.4202880859375 | 20 |
| 83.60494995117188 | 27 |
| 91.37966918945312 | 21 |
| 63.418609619140625 | 25 |
| 124.6976089477539 | 20 |
| 341.4202880859375 | 28 |
| 219.49485778808594 | 24 |
| 92.2071304321289 | 26 |
| 754.3591918945312 | 21 |
| 754.3591918945312 | 21 |
| 455.0025329589844 | 22 |
| 484.7658996582031 | 21 |
| 468.41375732421875 | 22 |
| 478.2410583496094 | 18 |
| 478.2410583496094 | 21 |
| 148.3187255859375 | 16 |
| 142.7567596435547 | 14 |
| 235.20913696289062 | 13 |
| 235.20913696289062 | 13 |
| 187.38137817382812 | 13 |
| 113.19035339355469 | 18 |
| 152.23812866210938 | 13 |
| 149.9208984375 | 16 |
| 148.3187255859375 | 16 |
| 285.5185241699219 | 16 |
| 32.831363677978516 | 12 |
| 119.2886734008789 | 16 |
| 142.62008666992188 | 10 |
| 97.52442169189453 | 11 |
| 136.7212371826172 | 12 |
| 252.2563934326172 | 19 |
| 174.3083038330078 | 16 |
| 219.75401306152344 | 15 |
| 255.4943389892578 | 14 |
| 198.63182067871094 | 18 |
| 170.60543823242188 | 20 |
| 179.9371795654297 | 14 |
| 198.63182067871094 | 13 |
| 225.14097595214844 | 16 |
| 177.6800994873047 | 13 |
| 228.98504638671875 | 19 |
| 198.63182067871094 | 12 |
| 137.0381622314453 | 12 |
| 247.63380432128906 | 13 |
| 251.30638122558594 | 13 |
| 159.80015563964844 | 16 |
| 567.9818115234375 | 12 |
| 120.04975891113281 | 16 |
| 153.33436584472656 | 15 |
| 43.33876037597656 | 18 |
| 545.0861206054688 | 16 |
| 141.55538940429688 | 19 |
| 138.41897583007812 | 11 |
| 279.81097412109375 | 21 |
| 317.2491149902344 | 19 |
| 545.0861206054688 | 16 |
| 0.0 | 13 |
| 293.6569519042969 | 19 |
| 219.49485778808594 | 22 |
| 754.3591918945312 | 18 |
| 754.3591918945312 | 21 |
| 455.0025329589844 | 21 |
| 484.7658996582031 | 21 |
| 468.41375732421875 | 22 |
| 478.2410583496094 | 20 |
| 478.2410583496094 | 20 |
| 148.3187255859375 | 17 |
| 142.7567596435547 | 15 |
| 235.20913696289062 | 13 |
| 235.20913696289062 | 11 |
| 187.38137817382812 | 15 |
| 113.19035339355469 | 17 |
| 152.23812866210938 | 9 |
| 149.9208984375 | 21 |
| 148.3187255859375 | 16 |
| 285.5185241699219 | 15 |
| 32.831363677978516 | 9 |
| 119.2886734008789 | 18 |
| 142.62008666992188 | 17 |
| 97.52442169189453 | 13 |
| 136.7212371826172 | 19 |
| 252.2563934326172 | 20 |
| 174.3083038330078 | 15 |
| 219.75401306152344 | 15 |
| 255.4943389892578 | 14 |
| 198.63182067871094 | 16 |
| 170.60543823242188 | 20 |
| 179.9371795654297 | 17 |
| 198.63182067871094 | 10 |
| 225.14097595214844 | 14 |
| 177.6800994873047 | 18 |
| 228.98504638671875 | 20 |
| 198.63182067871094 | 14 |
| 137.0381622314453 | 16 |
| 247.63380432128906 | 15 |
| 251.30638122558594 | 16 |
| 159.80015563964844 | 20 |
| 567.9818115234375 | 17 |
| 120.04975891113281 | 19 |
| 153.33436584472656 | 18 |
| 43.33876037597656 | 19 |
| 545.0861206054688 | 14 |
| 141.55538940429688 | 15 |
| 138.41897583007812 | 11 |
| 279.81097412109375 | 20 |
| 317.2491149902344 | 18 |
| 545.0861206054688 | 20 |
| 0.0 | 18 |
| 293.6569519042969 | 16 |
| 219.49485778808594 | 22 |
| 0.0 | 13 |
| 616.168212890625 | 22 |
| 616.168212890625 | 26 |
| 294.7120056152344 | 25 |
| 325.2622375488281 | 26 |
| 303.05450439453125 | 25 |
| 312.0703125 | 20 |
| 312.0703125 | 26 |
| 129.340576171875 | 19 |
| 107.08181762695312 | 19 |
| 73.0390853881836 | 19 |
| 73.0390853881836 | 17 |
| 61.27021026611328 | 16 |
| 112.88919067382812 | 20 |
| 134.5211944580078 | 15 |
| 128.67520141601562 | 22 |
| 129.340576171875 | 21 |
| 116.54285430908203 | 20 |
| 141.83238220214844 | 16 |
| 56.98612976074219 | 23 |
| 38.02828598022461 | 18 |
| 127.8241195678711 | 17 |
| 224.5315399169922 | 23 |
| 78.56605529785156 | 23 |
| 15.383030891418457 | 18 |
| 48.196571350097656 | 21 |
| 81.93755340576172 | 17 |
| 52.357566833496094 | 20 |
| 14.68608570098877 | 22 |
| 52.00267028808594 | 22 |
| 52.357566833496094 | 16 |
| 52.84941101074219 | 21 |
| 43.13503646850586 | 19 |
| 55.47516632080078 | 23 |
| 52.357566833496094 | 12 |
| 40.21868896484375 | 17 |
| 86.8005599975586 | 18 |
| 90.77255249023438 | 20 |
| 37.6650505065918 | 20 |
| 401.1644287109375 | 19 |
| 218.33909606933594 | 21 |
| 126.28498840332031 | 20 |
| 170.93280029296875 | 26 |
| 377.6264953613281 | 14 |
| 35.50679016113281 | 20 |
| 60.46622848510742 | 18 |
| 111.44709777832031 | 28 |
| 167.53297424316406 | 23 |
| 377.6264953613281 | 20 |
| 173.69821166992188 | 18 |
| 136.76181030273438 | 21 |
| 48.115692138671875 | 26 |
| 173.69821166992188 | 14 |
| 173.69821166992188 | 14 |
| 614.4407958984375 | 24 |
| 614.4407958984375 | 21 |
| 277.8712463378906 | 23 |
| 306.3036804199219 | 28 |
| 271.3548583984375 | 26 |
| 276.7159118652344 | 20 |
| 276.7159118652344 | 23 |
| 257.7701721191406 | 18 |
| 236.03526306152344 | 18 |
| 138.06289672851562 | 11 |
| 138.06289672851562 | 15 |
| 175.2203369140625 | 15 |
| 243.55615234375 | 16 |
| 262.53253173828125 | 18 |
| 256.8666687011719 | 16 |
| 257.7701721191406 | 13 |
| 45.394248962402344 | 20 |
| 257.4127502441406 | 18 |
| 169.60252380371094 | 13 |
| 146.5932159423828 | 15 |
| 257.9292907714844 | 12 |
| 355.0388488769531 | 16 |
| 87.07774353027344 | 10 |
| 141.3492889404297 | 20 |
| 87.8258056640625 | 15 |
| 93.46704864501953 | 13 |
| 156.6420440673828 | 16 |
| 143.06719970703125 | 21 |
| 105.3849105834961 | 11 |
| 156.6420440673828 | 16 |
| 86.42926025390625 | 15 |
| 108.49011993408203 | 16 |
| 91.64757537841797 | 15 |
| 156.6420440673828 | 14 |
| 169.0654754638672 | 17 |
| 44.19257736206055 | 18 |
| 144.9664306640625 | 20 |
| 127.14956665039062 | 20 |
| 355.65673828125 | 14 |
| 348.2289123535156 | 18 |
| 253.8974151611328 | 19 |
| 293.5374450683594 | 17 |
| 331.7461853027344 | 18 |
| 164.70751953125 | 19 |
| 146.87356567382812 | 17 |
| 43.28995132446289 | 16 |
| 37.19908142089844 | 15 |
| 331.7461853027344 | 17 |
| 285.2757568359375 | 24 |
| 9.438192367553711 | 21 |
| 87.52318572998047 | 20 |
| 285.2757568359375 | 16 |
| 285.2757568359375 | 16 |
| 130.68458557128906 | 23 |
| 754.3591918945312 | 23 |
| 754.3591918945312 | 26 |
| 455.0025329589844 | 24 |
| 484.7658996582031 | 27 |
| 468.41375732421875 | 23 |
| 478.2410583496094 | 20 |
| 478.2410583496094 | 22 |
| 148.3187255859375 | 16 |
| 142.7567596435547 | 17 |
| 235.20913696289062 | 19 |
| 235.20913696289062 | 18 |
| 187.38137817382812 | 21 |
| 113.19035339355469 | 20 |
| 152.23812866210938 | 17 |
| 149.9208984375 | 18 |
| 148.3187255859375 | 15 |
| 285.5185241699219 | 17 |
| 32.831363677978516 | 18 |
| 119.2886734008789 | 20 |
| 142.62008666992188 | 19 |
| 97.52442169189453 | 15 |
| 136.7212371826172 | 19 |
| 252.2563934326172 | 24 |
| 174.3083038330078 | 19 |
| 219.75401306152344 | 19 |
| 255.4943389892578 | 14 |
| 198.63182067871094 | 24 |
| 170.60543823242188 | 20 |
| 179.9371795654297 | 19 |
| 198.63182067871094 | 20 |
| 225.14097595214844 | 22 |
| 177.6800994873047 | 17 |
| 228.98504638671875 | 21 |
| 198.63182067871094 | 15 |
| 137.0381622314453 | 20 |
| 247.63380432128906 | 17 |
| 251.30638122558594 | 17 |
| 159.80015563964844 | 24 |
| 567.9818115234375 | 19 |
| 120.04975891113281 | 22 |
| 153.33436584472656 | 18 |
| 43.33876037597656 | 23 |
| 545.0861206054688 | 20 |
| 141.55538940429688 | 21 |
| 138.41897583007812 | 18 |
| 279.81097412109375 | 27 |
| 317.2491149902344 | 25 |
| 545.0861206054688 | 23 |
| 0.0 | 19 |
| 293.6569519042969 | 21 |
| 219.49485778808594 | 23 |
| 0.0 | 16 |
| 0.0 | 17 |
| 173.69821166992188 | 19 |
| 285.2757568359375 | 21 |
| 401.0015869140625 | 25 |
| 401.0015869140625 | 20 |
| 507.173095703125 | 22 |
| 481.0037536621094 | 22 |
| 487.2606506347656 | 23 |
| 476.71710205078125 | 23 |
| 476.71710205078125 | 23 |
| 839.0137329101562 | 17 |
| 829.8889770507812 | 18 |
| 717.2459716796875 | 17 |
| 717.2459716796875 | 16 |
| 768.2723388671875 | 14 |
| 856.6116943359375 | 15 |
| 839.2533569335938 | 14 |
| 837.1232299804688 | 20 |
| 839.0137329101562 | 15 |
| 685.86083984375 | 16 |
| 919.5089721679688 | 19 |
| 838.2827758789062 | 17 |
| 817.1891479492188 | 19 |
| 876.5310668945312 | 15 |
| 944.35205078125 | 21 |
| 704.803466796875 | 18 |
| 778.5560302734375 | 16 |
| 740.3206176757812 | 18 |
| 700.1583251953125 | 16 |
| 754.5869140625 | 16 |
| 782.322021484375 | 20 |
| 794.59423828125 | 15 |
| 754.5869140625 | 14 |
| 734.4231567382812 | 16 |
| 792.248046875 | 17 |
| 728.420166015625 | 21 |
| 754.5869140625 | 11 |
| 815.487548828125 | 17 |
| 728.3170776367188 | 16 |
| 701.6695556640625 | 19 |
| 805.5431518554688 | 18 |
| 388.1219787597656 | 15 |
| 949.24853515625 | 17 |
| 832.3892822265625 | 16 |
| 938.2474365234375 | 17 |
| 409.5183410644531 | 18 |
| 811.0900268554688 | 19 |
| 831.9651489257812 | 15 |
| 691.8775634765625 | 19 |
| 697.6193237304688 | 19 |
| 409.5183410644531 | 19 |
| 952.2849731445312 | 20 |
| 700.2406005859375 | 19 |
| 740.7576904296875 | 20 |
| 952.2849731445312 | 15 |
| 952.2849731445312 | 14 |
| 781.3649291992188 | 14 |
| 709.5484619140625 | 17 |
| 952.2849731445312 | 20 |
| 598.3757934570312 | 23 |
| 598.3757934570312 | 17 |
| 268.90399169921875 | 22 |
| 299.4304504394531 | 19 |
| 273.21527099609375 | 24 |
| 281.4234924316406 | 19 |
| 281.4234924316406 | 20 |
| 168.63217163085938 | 20 |
| 147.02450561523438 | 16 |
| 64.94690704345703 | 15 |
| 64.94690704345703 | 13 |
| 87.30329895019531 | 14 |
| 156.40248107910156 | 18 |
| 173.35472106933594 | 16 |
| 167.7058868408203 | 17 |
| 168.63217163085938 | 13 |
| 71.64421844482422 | 21 |
| 184.7071533203125 | 19 |
| 96.7092514038086 | 21 |
| 73.91231536865234 | 19 |
| 172.17054748535156 | 12 |
| 268.2389831542969 | 14 |
| 40.475303649902344 | 19 |
| 52.89030075073242 | 12 |
| 4.3164591789245605 | 10 |
| 46.54570770263672 | 17 |
| 70.0205078125 | 15 |
| 55.09328079223633 | 19 |
| 55.04310607910156 | 13 |
| 70.0205078125 | 11 |
| 10.27522087097168 | 14 |
| 49.865501403808594 | 14 |
| 18.418819427490234 | 20 |
| 70.0205078125 | 14 |
| 85.14312744140625 | 8 |
| 45.178802490234375 | 15 |
| 79.49700164794922 | 13 |
| 60.96567153930664 | 16 |
| 369.0884704589844 | 11 |
| 262.653076171875 | 15 |
| 164.7071075439453 | 15 |
| 215.48171997070312 | 13 |
| 345.2032775878906 | 21 |
| 80.43756103515625 | 17 |
| 87.53925323486328 | 16 |
| 66.51612091064453 | 15 |
| 126.39327239990234 | 20 |
| 345.2032775878906 | 15 |
| 215.81639099121094 | 18 |
| 94.18133544921875 | 16 |
| 3.85141658782959 | 24 |
| 215.81639099121094 | 13 |
| 215.81639099121094 | 13 |
| 44.931034088134766 | 21 |
| 89.19441986083984 | 16 |
| 215.81639099121094 | 21 |
| 744.6089477539062 | 13 |
| 141.25750732421875 | 21 |
| 141.25750732421875 | 21 |
| 195.97640991210938 | 18 |
| 168.69696044921875 | 20 |
| 207.94998168945312 | 22 |
| 206.28759765625 | 18 |
| 206.28759765625 | 20 |
| 480.44537353515625 | 15 |
| 479.5035705566406 | 15 |
| 403.4898681640625 | 15 |
| 403.4898681640625 | 13 |
| 437.1352233886719 | 14 |
| 509.2340393066406 | 19 |
| 478.5863342285156 | 14 |
| 478.5636901855469 | 20 |
| 480.44537353515625 | 16 |
| 431.7749938964844 | 19 |
| 588.83447265625 | 12 |
| 528.5425415039062 | 19 |
| 514.1759643554688 | 16 |
| 527.7192993164062 | 17 |
| 570.0106811523438 | 20 |
| 420.0335693359375 | 18 |
| 466.89862060546875 | 17 |
| 453.5900573730469 | 19 |
| 412.64434814453125 | 17 |
| 431.5865173339844 | 17 |
| 470.46337890625 | 19 |
| 512.2958984375 | 17 |
| 431.5865173339844 | 15 |
| 448.1266174316406 | 16 |
| 506.0946960449219 | 21 |
| 439.11444091796875 | 17 |
| 431.5865173339844 | 18 |
| 497.2158508300781 | 19 |
| 466.42767333984375 | 15 |
| 385.7743835449219 | 16 |
| 511.4526062011719 | 21 |
| 171.71060180664062 | 18 |
| 579.421630859375 | 16 |
| 474.195068359375 | 19 |
| 593.109130859375 | 22 |
| 184.03001403808594 | 19 |
| 494.0713195800781 | 21 |
| 536.6832885742188 | 15 |
| 436.24542236328125 | 23 |
| 485.1156311035156 | 20 |
| 184.03001403808594 | 21 |
| 620.1819458007812 | 19 |
| 467.1764831542969 | 21 |
| 454.23748779296875 | 19 |
| 620.1819458007812 | 15 |
| 620.1819458007812 | 13 |
| 476.51495361328125 | 18 |
| 473.7770080566406 | 18 |
| 620.1819458007812 | 20 |
| 426.5465087890625 | 16 |
| 457.50238037109375 | 16 |
| 172.0505828857422 | 22 |
| 172.0505828857422 | 17 |
| 248.05230712890625 | 20 |
| 217.77371215820312 | 25 |
| 241.10032653808594 | 21 |
| 233.50054931640625 | 22 |
| 233.50054931640625 | 20 |
| 573.0924072265625 | 20 |
| 567.9464721679688 | 20 |
| 471.2272033691406 | 12 |
| 471.2272033691406 | 12 |
| 514.8112182617188 | 15 |
| 596.7152099609375 | 21 |
| 572.2848510742188 | 16 |
| 571.1740112304688 | 15 |
| 573.0924072265625 | 13 |
| 471.62506103515625 | 21 |
| 669.616455078125 | 20 |
| 598.1847534179688 | 21 |
| 580.2632446289062 | 21 |
| 616.2360229492188 | 15 |
| 671.9052124023438 | 14 |
| 474.01361083984375 | 19 |
| 535.7550048828125 | 16 |
| 509.9338684082031 | 12 |
| 467.6329040527344 | 15 |
| 504.9797668457031 | 15 |
| 539.5258178710938 | 18 |
| 568.655517578125 | 16 |
| 504.9797668457031 | 14 |
| 504.0455322265625 | 13 |
| 564.03955078125 | 16 |
| 496.1212463378906 | 20 |
| 504.9797668457031 | 16 |
| 570.1375732421875 | 17 |
| 511.59735107421875 | 17 |
| 453.9130859375 | 12 |
| 573.2686157226562 | 17 |
| 152.59654235839844 | 11 |
| 679.1246948242188 | 19 |
| 566.5413818359375 | 14 |
| 680.8489990234375 | 17 |
| 176.05145263671875 | 19 |
| 566.3045654296875 | 16 |
| 599.779296875 | 15 |
| 477.05609130859375 | 18 |
| 508.9588317871094 | 20 |
| 176.05145263671875 | 20 |
| 702.1467895507812 | 20 |
| 499.2033996582031 | 17 |
| 510.50592041015625 | 24 |
| 702.1467895507812 | 17 |
| 702.1467895507812 | 16 |
| 542.3672485351562 | 20 |
| 507.3572692871094 | 20 |
| 702.1467895507812 | 21 |
| 293.861328125 | 18 |
| 514.1781005859375 | 13 |
| 134.21714782714844 | 18 |
| 605.9974365234375 | 22 |
| 605.9974365234375 | 21 |
| 276.09869384765625 | 22 |
| 306.6000671386719 | 25 |
| 279.9798889160156 | 25 |
| 288.0767517089844 | 18 |
| 288.0767517089844 | 20 |
| 171.21046447753906 | 22 |
| 149.3499755859375 | 19 |
| 72.53156280517578 | 15 |
| 72.53156280517578 | 13 |
| 91.95181274414062 | 14 |
| 157.28829956054688 | 19 |
| 176.0771026611328 | 18 |
| 170.3585205078125 | 21 |
| 171.21046447753906 | 16 |
| 73.41068267822266 | 25 |
| 181.8641357421875 | 17 |
| 93.28187561035156 | 22 |
| 70.08509826660156 | 20 |
| 172.45823669433594 | 15 |
| 269.0475158691406 | 16 |
| 47.019287109375 | 19 |
| 54.58815002441406 | 18 |
| 11.497657775878906 | 18 |
| 53.494720458984375 | 15 |
| 75.4288558959961 | 15 |
| 56.33343505859375 | 21 |
| 47.79615783691406 | 14 |
| 75.4288558959961 | 12 |
| 17.100868225097656 | 10 |
| 43.160648345947266 | 19 |
| 25.988496780395508 | 20 |
| 75.4288558959961 | 21 |
| 84.43025207519531 | 18 |
| 42.594112396240234 | 11 |
| 87.28685760498047 | 16 |
| 55.66828155517578 | 16 |
| 375.4752502441406 | 17 |
| 262.9748229980469 | 19 |
| 167.52378845214844 | 15 |
| 213.739990234375 | 18 |
| 351.5519104003906 | 18 |
| 79.82048797607422 | 22 |
| 81.94976806640625 | 17 |
| 67.96094512939453 | 16 |
| 123.88027954101562 | 22 |
| 351.5519104003906 | 14 |
| 212.5688934326172 | 15 |
| 92.40486145019531 | 20 |
| 10.848226547241211 | 22 |
| 212.5688934326172 | 16 |
| 212.5688934326172 | 17 |
| 44.63652038574219 | 22 |
| 86.76616668701172 | 17 |
| 212.5688934326172 | 24 |
| 750.01611328125 | 14 |
| 7.858829021453857 | 12 |
| 465.085693359375 | 17 |
| 521.014404296875 | 17 |
| 76.77801513671875 | 22 |
| 76.77801513671875 | 20 |
| 298.4950866699219 | 21 |
| 273.6326599121094 | 21 |
| 314.3398742675781 | 24 |
| 313.6916198730469 | 16 |
| 313.6916198730469 | 18 |
| 546.3301391601562 | 20 |
| 549.1411743164062 | 17 |
| 489.9959716796875 | 16 |
| 489.9959716796875 | 16 |
| 516.3311157226562 | 13 |
| 578.8543701171875 | 22 |
| 543.5487670898438 | 18 |
| 544.5396728515625 | 21 |
| 546.3301391601562 | 18 |
| 530.2596435546875 | 19 |
| 662.0107421875 | 17 |
| 610.672607421875 | 20 |
| 598.7667236328125 | 19 |
| 595.978515625 | 14 |
| 624.0245971679688 | 17 |
| 513.08984375 | 19 |
| 550.9463500976562 | 18 |
| 544.7342529296875 | 18 |
| 505.42816162109375 | 17 |
| 513.8019409179688 | 17 |
| 554.2958984375 | 18 |
| 602.2024536132812 | 16 |
| 513.8019409179688 | 15 |
| 539.6016845703125 | 16 |
| 595.3198852539062 | 19 |
| 530.2798461914062 | 18 |
| 513.8019409179688 | 19 |
| 577.9583129882812 | 20 |
| 562.2415771484375 | 13 |
| 472.6312255859375 | 14 |
| 598.521240234375 | 18 |
| 279.7236022949219 | 15 |
| 635.633056640625 | 12 |
| 540.5479125976562 | 16 |
| 660.550048828125 | 21 |
| 293.18316650390625 | 19 |
| 575.3367309570312 | 23 |
| 622.5401611328125 | 17 |
| 534.2997436523438 | 20 |
| 587.7534790039062 | 22 |
| 293.18316650390625 | 18 |
| 691.8482055664062 | 18 |
| 567.669921875 | 19 |
| 545.4032592773438 | 24 |
| 691.8482055664062 | 17 |
| 691.8482055664062 | 17 |
| 562.09326171875 | 21 |
| 573.673828125 | 19 |
| 691.8482055664062 | 21 |
| 463.0831298828125 | 17 |
| 548.3956909179688 | 15 |
| 109.42603302001953 | 15 |
| 199.9594268798828 | 15 |
| 556.172119140625 | 15 |
| 665.3187255859375 | 26 |
| 665.3187255859375 | 22 |
| 333.4513854980469 | 26 |
| 363.7613525390625 | 24 |
| 335.03497314453125 | 25 |
| 342.48785400390625 | 21 |
| 342.48785400390625 | 20 |
| 196.76016235351562 | 17 |
| 174.47691345214844 | 19 |
| 130.97760009765625 | 20 |
| 130.97760009765625 | 17 |
| 135.22503662109375 | 17 |
| 172.08682250976562 | 18 |
| 202.3578643798828 | 20 |
| 196.4496612548828 | 20 |
| 196.76016235351562 | 16 |
| 109.71826934814453 | 23 |
| 166.56341552734375 | 20 |
| 84.1872329711914 | 19 |
| 65.2351303100586 | 20 |
| 181.96551513671875 | 18 |
| 278.38812255859375 | 24 |
| 104.29169464111328 | 21 |
| 89.51573944091797 | 21 |
| 71.49537658691406 | 20 |
| 111.60855865478516 | 18 |
| 123.82030487060547 | 19 |
| 88.58149719238281 | 20 |
| 22.675260543823242 | 16 |
| 123.82030487060547 | 17 |
| 76.57103729248047 | 20 |
| 31.354888916015625 | 20 |
| 85.90882873535156 | 18 |
| 123.82030487060547 | 19 |
| 97.83403015136719 | 20 |
| 67.26570129394531 | 17 |
| 146.73397827148438 | 17 |
| 45.8578987121582 | 20 |
| 428.050537109375 | 19 |
| 268.8561096191406 | 19 |
| 194.85157775878906 | 15 |
| 205.60348510742188 | 18 |
| 403.98199462890625 | 22 |
| 94.98067474365234 | 26 |
| 55.343177795410156 | 19 |
| 103.70905303955078 | 21 |
| 125.09490203857422 | 22 |
| 403.98199462890625 | 26 |
| 192.30892944335938 | 20 |
| 104.28141784667969 | 16 |
| 70.82121276855469 | 22 |
| 192.30892944335938 | 19 |
| 192.30892944335938 | 17 |
| 74.1465072631836 | 24 |
| 95.24320220947266 | 19 |
| 192.30892944335938 | 20 |
| 795.5761108398438 | 16 |
| 67.98409271240234 | 17 |
| 524.2482299804688 | 18 |
| 575.978759765625 | 21 |
| 60.14291763305664 | 18 |
| 616.171875 | 16 |
| 576.904296875 | 24 |
| 576.904296875 | 24 |
| 240.6249237060547 | 24 |
| 269.89044189453125 | 27 |
| 237.1905059814453 | 27 |
| 243.54957580566406 | 23 |
| 243.54957580566406 | 23 |
| 231.56764221191406 | 23 |
| 210.87030029296875 | 20 |
| 100.55481719970703 | 19 |
| 100.55481719970703 | 16 |
| 144.97933959960938 | 16 |
| 222.9010009765625 | 15 |
| 235.81568908691406 | 15 |
| 230.43638610839844 | 23 |
| 231.56764221191406 | 20 |
| 5.07924222946167 | 21 |
| 250.63792419433594 | 21 |
| 161.76377868652344 | 20 |
| 138.32371520996094 | 20 |
| 239.28515625 | 13 |
| 334.5724182128906 | 22 |
| 49.071128845214844 | 19 |
| 119.38134765625 | 22 |
| 64.48779296875 | 23 |
| 53.96741485595703 | 15 |
| 125.44120788574219 | 21 |
| 121.9863052368164 | 26 |
| 105.61774444580078 | 19 |
| 125.44120788574219 | 15 |
| 60.55326843261719 | 20 |
| 105.16455841064453 | 20 |
| 61.79590606689453 | 22 |
| 125.44120788574219 | 16 |
| 152.75291442871094 | 21 |
| 37.37723159790039 | 17 |
| 104.8600082397461 | 23 |
| 121.67427825927734 | 24 |
| 326.3508605957031 | 17 |
| 329.61676025390625 | 21 |
| 226.980224609375 | 17 |
| 282.76947021484375 | 21 |
| 302.2690124511719 | 13 |
| 148.04840087890625 | 20 |
| 146.0564727783203 | 15 |
| 1.1037620306015015 | 23 |
| 73.62529754638672 | 21 |
| 302.2690124511719 | 23 |
| 280.90771484375 | 20 |
| 41.25190353393555 | 14 |
| 64.50782012939453 | 19 |
| 280.90771484375 | 17 |
| 280.90771484375 | 16 |
| 112.54170989990234 | 18 |
| 43.1243896484375 | 15 |
| 280.90771484375 | 22 |
| 690.93994140625 | 16 |
| 67.61090087890625 | 19 |
| 435.83447265625 | 21 |
| 476.3765563964844 | 20 |
| 69.06460571289062 | 20 |
| 533.9937133789062 | 21 |
| 104.63963317871094 | 21 |
| 72.35151672363281 | 23 |
| 72.35151672363281 | 21 |
| 266.13739013671875 | 23 |
| 237.35305786132812 | 21 |
| 274.15771484375 | 21 |
| 270.878173828125 | 20 |
| 270.878173828125 | 23 |
| 553.7892456054688 | 15 |
| 553.2994384765625 | 13 |
| 477.4918518066406 | 16 |
| 477.4918518066406 | 13 |
| 511.452392578125 | 17 |
| 583.0631713867188 | 14 |
| 551.7969970703125 | 12 |
| 551.916748046875 | 16 |
| 553.7892456054688 | 15 |
| 502.5522155761719 | 16 |
| 663.0057983398438 | 14 |
| 602.77685546875 | 18 |
| 588.25146484375 | 19 |
| 601.425048828125 | 15 |
| 641.432861328125 | 18 |
| 492.8355407714844 | 21 |
| 541.05224609375 | 17 |
| 526.7763061523438 | 15 |
| 485.5363464355469 | 15 |
| 505.8594970703125 | 19 |
| 544.6295166015625 | 20 |
| 585.6373901367188 | 14 |
| 505.8594970703125 | 10 |
| 521.2506713867188 | 13 |
| 579.572509765625 | 16 |
| 512.3252563476562 | 21 |
| 505.8594970703125 | 15 |
| 571.5119018554688 | 17 |
| 538.2351684570312 | 15 |
| 459.7637023925781 | 16 |
| 585.2586669921875 | 18 |
| 218.7104949951172 | 13 |
| 651.3159790039062 | 14 |
| 547.5914916992188 | 16 |
| 666.791748046875 | 20 |
| 236.20645141601562 | 15 |
| 568.3533935546875 | 19 |
| 610.6138305664062 | 14 |
| 507.2123107910156 | 17 |
| 553.0571899414062 | 20 |
| 236.20645141601562 | 20 |
| 694.2721557617188 | 17 |
| 536.7158813476562 | 19 |
| 527.4177856445312 | 20 |
| 694.2721557617188 | 13 |
| 694.2721557617188 | 9 |
| 550.5299072265625 | 18 |
| 543.6527709960938 | 15 |
| 694.2721557617188 | 19 |
| 388.3296203613281 | 11 |
| 530.73486328125 | 13 |
| 74.31827545166016 | 16 |
| 118.85688781738281 | 17 |
| 538.2623901367188 | 14 |
| 81.3782730102539 | 15 |
| 597.1228637695312 | 17 |
| 506.7535400390625 | 16 |
| 401.0015869140625 | 20 |
| 401.0015869140625 | 20 |
| 507.173095703125 | 20 |
| 481.0037536621094 | 18 |
| 487.2606506347656 | 21 |
| 476.71710205078125 | 17 |
| 476.71710205078125 | 20 |
| 839.0137329101562 | 19 |
| 829.8889770507812 | 14 |
| 717.2459716796875 | 16 |
| 717.2459716796875 | 13 |
| 768.2723388671875 | 14 |
| 856.6116943359375 | 13 |
| 839.2533569335938 | 10 |
| 837.1232299804688 | 20 |
| 839.0137329101562 | 16 |
| 685.86083984375 | 18 |
| 919.5089721679688 | 16 |
| 838.2827758789062 | 17 |
| 817.1891479492188 | 17 |
| 876.5310668945312 | 11 |
| 944.35205078125 | 18 |
| 704.803466796875 | 18 |
| 778.5560302734375 | 15 |
| 740.3206176757812 | 15 |
| 700.1583251953125 | 15 |
| 754.5869140625 | 17 |
| 782.322021484375 | 20 |
| 794.59423828125 | 13 |
| 754.5869140625 | 13 |
| 734.4231567382812 | 14 |
| 792.248046875 | 16 |
| 728.420166015625 | 18 |
| 754.5869140625 | 12 |
| 815.487548828125 | 14 |
| 728.3170776367188 | 15 |
| 701.6695556640625 | 17 |
| 805.5431518554688 | 17 |
| 388.1219787597656 | 12 |
| 949.24853515625 | 11 |
| 832.3892822265625 | 14 |
| 938.2474365234375 | 17 |
| 409.5183410644531 | 12 |
| 811.0900268554688 | 17 |
| 831.9651489257812 | 14 |
| 691.8775634765625 | 16 |
| 697.6193237304688 | 19 |
| 409.5183410644531 | 18 |
| 952.2849731445312 | 13 |
| 700.2406005859375 | 17 |
| 740.7576904296875 | 19 |
| 952.2849731445312 | 13 |
| 952.2849731445312 | 12 |
| 781.3649291992188 | 14 |
| 709.5484619140625 | 15 |
| 952.2849731445312 | 19 |
| 0.0 | 10 |
| 744.6089477539062 | 10 |
| 426.5465087890625 | 14 |
| 293.861328125 | 15 |
| 750.01611328125 | 14 |
| 463.0831298828125 | 12 |
| 795.5761108398438 | 17 |
| 690.93994140625 | 11 |
| 388.3296203613281 | 10 |
| 640.5927734375 | 19 |
| 640.5927734375 | 19 |
| 317.5599365234375 | 20 |
| 348.147705078125 | 23 |
| 324.7704162597656 | 20 |
| 333.52557373046875 | 17 |
| 333.52557373046875 | 18 |
| 139.3131866455078 | 14 |
| 116.98348236083984 | 15 |
| 97.32867431640625 | 15 |
| 97.32867431640625 | 15 |
| 82.94377136230469 | 15 |
| 116.53688049316406 | 18 |
| 144.8719024658203 | 13 |
| 138.9606170654297 | 16 |
| 139.3131866455078 | 14 |
| 125.85939025878906 | 20 |
| 129.31361389160156 | 15 |
| 40.48423385620117 | 19 |
| 17.313732147216797 | 16 |
| 128.48631286621094 | 12 |
| 225.85012817382812 | 14 |
| 95.47677612304688 | 19 |
| 38.152931213378906 | 17 |
| 60.735069274902344 | 16 |
| 100.17648315429688 | 15 |
| 76.4809799194336 | 20 |
| 35.76659393310547 | 19 |
| 35.10844802856445 | 15 |
| 76.4809799194336 | 16 |
| 66.4287338256836 | 15 |
| 27.219541549682617 | 17 |
| 71.83642578125 | 17 |
| 76.4809799194336 | 12 |
| 40.94145965576172 | 16 |
| 89.93096923828125 | 16 |
| 115.00688934326172 | 14 |
| 13.91521167755127 | 16 |
| 422.1847839355469 | 13 |
| 217.8663787841797 | 17 |
| 137.2929229736328 | 12 |
| 162.76705932617188 | 16 |
| 398.4888610839844 | 15 |
| 37.6596794128418 | 17 |
| 35.928855895996094 | 15 |
| 120.22775268554688 | 19 |
| 166.9420928955078 | 16 |
| 398.4888610839844 | 17 |
| 159.7654266357422 | 14 |
| 138.76327514648438 | 17 |
| 60.39609146118164 | 21 |
| 159.7654266357422 | 15 |
| 159.7654266357422 | 14 |
| 24.822006225585938 | 20 |
| 131.46316528320312 | 16 |
| 159.7654266357422 | 16 |
| 800.2465209960938 | 16 |
| 56.60498046875 | 14 |
| 500.7577209472656 | 15 |
| 564.7922973632812 | 16 |
| 52.83027648925781 | 16 |
| 586.819091796875 | 17 |
| 57.586669921875 | 16 |
| 121.32872772216797 | 19 |
| 574.6982421875 | 14 |
| 800.2465209960938 | 13 |
| 469.8912048339844 | 20 |
| 469.8912048339844 | 19 |
| 135.9222869873047 | 22 |
| 161.89483642578125 | 25 |
| 124.39311981201172 | 23 |
| 129.0364532470703 | 21 |
| 129.0364532470703 | 23 |
| 292.58660888671875 | 16 |
| 276.82696533203125 | 15 |
| 151.9674835205078 | 15 |
| 151.9674835205078 | 13 |
| 207.67138671875 | 15 |
| 298.1208190917969 | 16 |
| 294.98895263671875 | 13 |
| 290.9498596191406 | 21 |
| 292.58660888671875 | 17 |
| 112.8791275024414 | 19 |
| 347.7176208496094 | 16 |
| 262.8473205566406 | 18 |
| 241.00424194335938 | 18 |
| 317.33209228515625 | 12 |
| 402.81707763671875 | 19 |
| 128.4995574951172 | 19 |
| 206.03851318359375 | 16 |
| 163.51548767089844 | 17 |
| 124.60136413574219 | 14 |
| 190.1125030517578 | 19 |
| 209.65757751464844 | 22 |
| 218.04701232910156 | 18 |
| 190.1125030517578 | 14 |
| 157.65841674804688 | 13 |
| 215.3748016357422 | 16 |
| 152.13890075683594 | 20 |
| 190.1125030517578 | 14 |
| 243.4169464111328 | 18 |
| 154.4011688232422 | 13 |
| 140.81858825683594 | 19 |
| 228.64361572265625 | 19 |
| 208.76014709472656 | 15 |
| 402.3246154785156 | 18 |
| 286.5104064941406 | 16 |
| 372.511962890625 | 20 |
| 184.7073974609375 | 10 |
| 238.77267456054688 | 13 |
| 255.0144500732422 | 15 |
| 118.58614349365234 | 19 |
| 154.7427520751953 | 19 |
| 184.7073974609375 | 20 |
| 379.9762268066406 | 16 |
| 140.16429138183594 | 18 |
| 163.932861328125 | 18 |
| 379.9762268066406 | 15 |
| 379.9762268066406 | 11 |
| 206.53829956054688 | 13 |
| 147.9806365966797 | 17 |
| 379.9762268066406 | 18 |
| 576.959228515625 | 13 |
| 167.78292846679688 | 16 |
| 330.59088134765625 | 17 |
| 359.67822265625 | 15 |
| 173.0651397705078 | 17 |
| 434.3944091796875 | 19 |
| 221.05201721191406 | 20 |
| 117.80614471435547 | 11 |
| 398.3367004394531 | 13 |
| 576.959228515625 | 9 |
| 223.86734008789062 | 18 |
| 172.0505828857422 | 19 |
| 172.0505828857422 | 20 |
| 248.05230712890625 | 21 |
| 217.77371215820312 | 26 |
| 241.10032653808594 | 23 |
| 233.50054931640625 | 13 |
| 233.50054931640625 | 21 |
| 573.0924072265625 | 16 |
| 567.9464721679688 | 17 |
| 471.2272033691406 | 15 |
| 471.2272033691406 | 13 |
| 514.8112182617188 | 14 |
| 596.7152099609375 | 16 |
| 572.2848510742188 | 14 |
| 571.1740112304688 | 17 |
| 573.0924072265625 | 16 |
| 471.62506103515625 | 20 |
| 669.616455078125 | 19 |
| 598.1847534179688 | 19 |
| 580.2632446289062 | 18 |
| 616.2360229492188 | 13 |
| 671.9052124023438 | 19 |
| 474.01361083984375 | 16 |
| 535.7550048828125 | 16 |
| 509.9338684082031 | 16 |
| 467.6329040527344 | 13 |
| 504.9797668457031 | 16 |
| 539.5258178710938 | 20 |
| 568.655517578125 | 14 |
| 504.9797668457031 | 11 |
| 504.0455322265625 | 11 |
| 564.03955078125 | 17 |
| 496.1212463378906 | 19 |
| 504.9797668457031 | 12 |
| 570.1375732421875 | 15 |
| 511.59735107421875 | 13 |
| 453.9130859375 | 18 |
| 573.2686157226562 | 16 |
| 152.59654235839844 | 13 |
| 679.1246948242188 | 17 |
| 566.5413818359375 | 16 |
| 680.8489990234375 | 18 |
| 176.05145263671875 | 17 |
| 566.3045654296875 | 19 |
| 599.779296875 | 15 |
| 477.05609130859375 | 21 |
| 508.9588317871094 | 16 |
| 176.05145263671875 | 15 |
| 702.1467895507812 | 16 |
| 499.2033996582031 | 15 |
| 510.50592041015625 | 21 |
| 702.1467895507812 | 14 |
| 702.1467895507812 | 13 |
| 542.3672485351562 | 14 |
| 507.3572692871094 | 16 |
| 702.1467895507812 | 20 |
| 293.861328125 | 13 |
| 514.1781005859375 | 12 |
| 134.21714782714844 | 16 |
| 0.0 | 15 |
| 521.014404296875 | 12 |
| 199.9594268798828 | 16 |
| 575.978759765625 | 18 |
| 476.3765563964844 | 18 |
| 118.85688781738281 | 13 |
| 293.861328125 | 12 |
| 564.7922973632812 | 12 |
| 359.67822265625 | 14 |
| 626.5042724609375 | 25 |
| 626.5042724609375 | 23 |
| 308.56011962890625 | 24 |
| 339.0152282714844 | 22 |
| 318.1669921875 | 23 |
| 327.4113464355469 | 21 |
| 327.4113464355469 | 24 |
| 115.67255401611328 | 19 |
| 93.2790756225586 | 17 |
| 85.4575424194336 | 17 |
| 85.4575424194336 | 18 |
| 60.099365234375 | 14 |
| 95.96871185302734 | 17 |
| 121.11125946044922 | 13 |
| 115.2046890258789 | 16 |
| 115.67255401611328 | 16 |
| 135.36578369140625 | 19 |
| 123.47281646728516 | 15 |
| 41.679561614990234 | 20 |
| 28.70282554626465 | 15 |
| 109.99833679199219 | 15 |
| 207.1109619140625 | 16 |
| 96.96511840820312 | 22 |
| 20.841800689697266 | 16 |
| 67.06525421142578 | 17 |
| 99.9288330078125 | 17 |
| 57.32216262817383 | 20 |
| 17.13817596435547 | 21 |
| 59.49094772338867 | 16 |
| 57.32216262817383 | 16 |
| 71.74577331542969 | 20 |
| 51.07764434814453 | 16 |
| 74.14796447753906 | 22 |
| 57.32216262817383 | 10 |
| 21.500093460083008 | 14 |
| 104.47846221923828 | 19 |
| 103.03125762939453 | 15 |
| 38.496612548828125 | 19 |
| 416.7880554199219 | 14 |
| 200.4091339111328 | 18 |
| 113.28559875488281 | 17 |
| 152.04071044921875 | 20 |
| 393.3943786621094 | 19 |
| 16.898094177246094 | 22 |
| 54.01841735839844 | 15 |
| 130.21986389160156 | 21 |
| 184.49107360839844 | 21 |
| 393.3943786621094 | 20 |
| 155.5850830078125 | 18 |
| 154.38931274414062 | 23 |
| 66.97071075439453 | 25 |
| 155.5850830078125 | 8 |
| 155.5850830078125 | 17 |
| 18.896957397460938 | 16 |
| 147.95199584960938 | 19 |
| 155.5850830078125 | 18 |
| 798.2508544921875 | 12 |
| 63.7237548828125 | 14 |
| 487.5135803222656 | 18 |
| 556.5323486328125 | 20 |
| 62.93451690673828 | 18 |
| 570.9527587890625 | 18 |
| 82.14270782470703 | 20 |
| 131.31683349609375 | 22 |
| 561.6946411132812 | 14 |
| 798.2508544921875 | 11 |
| 24.948400497436523 | 14 |
| 224.3987274169922 | 20 |
| 556.5323486328125 | 16 |
| 217.48162841796875 | 25 |
| 217.48162841796875 | 21 |
| 128.10377502441406 | 24 |
| 106.07610321044922 | 21 |
| 147.87416076660156 | 25 |
| 149.52676391601562 | 18 |
| 149.52676391601562 | 23 |
| 403.30340576171875 | 21 |
| 401.7833251953125 | 13 |
| 325.87908935546875 | 18 |
| 325.87908935546875 | 18 |
| 358.857177734375 | 17 |
| 431.4616394042969 | 20 |
| 401.6199035644531 | 16 |
| 401.4112548828125 | 22 |
| 403.30340576171875 | 19 |
| 359.3258972167969 | 20 |
| 510.6591491699219 | 20 |
| 450.4720764160156 | 23 |
| 436.3899841308594 | 21 |
| 450.0914306640625 | 13 |
| 495.2465515136719 | 16 |
| 344.4254455566406 | 20 |
| 388.9876403808594 | 16 |
| 377.2994689941406 | 18 |
| 336.9062194824219 | 19 |
| 353.4482421875 | 20 |
| 392.5286865234375 | 22 |
| 435.6903991699219 | 13 |
| 353.4482421875 | 14 |
| 371.94427490234375 | 16 |
| 429.28143310546875 | 19 |
| 362.8060607910156 | 20 |
| 353.4482421875 | 17 |
| 419.0201721191406 | 19 |
| 392.2651062011719 | 13 |
| 308.1986083984375 | 17 |
| 434.1128234863281 | 18 |
| 150.03016662597656 | 13 |
| 504.0386047363281 | 15 |
| 396.9895935058594 | 14 |
| 515.4862060546875 | 17 |
| 152.05709838867188 | 16 |
| 415.9076232910156 | 22 |
| 459.1306457519531 | 16 |
| 363.4830322265625 | 19 |
| 416.6122131347656 | 21 |
| 152.05709838867188 | 17 |
| 542.0886840820312 | 16 |
| 396.4293212890625 | 19 |
| 377.9555358886719 | 23 |
| 542.0886840820312 | 15 |
| 542.0886840820312 | 18 |
| 398.84490966796875 | 21 |
| 402.498046875 | 18 |
| 542.0886840820312 | 19 |
| 477.10528564453125 | 15 |
| 381.132080078125 | 13 |
| 78.28453826904297 | 17 |
| 185.41094970703125 | 17 |
| 388.7940673828125 | 15 |
| 171.26614379882812 | 11 |
| 448.3456726074219 | 19 |
| 363.14776611328125 | 16 |
| 152.59695434570312 | 14 |
| 477.10528564453125 | 9 |
| 423.2031555175781 | 14 |
| 263.8811950683594 | 18 |
| 185.41094970703125 | 16 |
| 409.5479431152344 | 16 |
| 566.5767822265625 | 22 |
| 566.5767822265625 | 22 |
| 230.47181701660156 | 24 |
| 259.8876037597656 | 27 |
| 227.72247314453125 | 24 |
| 234.3025360107422 | 21 |
| 234.3025360107422 | 24 |
| 227.6403045654297 | 18 |
| 207.36859130859375 | 18 |
| 93.29940032958984 | 18 |
| 93.29940032958984 | 15 |
| 140.2185821533203 | 19 |
| 220.7264862060547 | 18 |
| 231.70687866210938 | 13 |
| 226.4409942626953 | 20 |
| 227.6403045654297 | 18 |
| 9.10072135925293 | 18 |
| 252.17869567871094 | 19 |
| 163.6516876220703 | 21 |
| 140.39268493652344 | 21 |
| 237.6245880126953 | 15 |
| 332.0716552734375 | 23 |
| 42.76585006713867 | 16 |
| 117.77603912353516 | 15 |
| 64.1386489868164 | 17 |
| 46.4981803894043 | 15 |
| 120.52810668945312 | 20 |
| 120.6207046508789 | 23 |
| 110.38806915283203 | 17 |
| 120.52810668945312 | 11 |
| 59.479610443115234 | 12 |
| 109.10892486572266 | 17 |
| 59.01668167114258 | 20 |
| 120.52810668945312 | 15 |
| 152.40499877929688 | 20 |
| 44.568511962890625 | 13 |
| 96.27498626708984 | 21 |
| 124.73725128173828 | 16 |
| 317.88604736328125 | 15 |
| 327.6632995605469 | 17 |
| 222.84283447265625 | 17 |
| 283.12908935546875 | 20 |
| 293.7962341308594 | 12 |
| 147.65524291992188 | 18 |
| 149.8846893310547 | 18 |
| 11.08303165435791 | 20 |
| 83.05522155761719 | 20 |
| 293.7962341308594 | 21 |
| 282.9402770996094 | 19 |
| 51.488136291503906 | 15 |
| 64.27425384521484 | 21 |
| 282.9402770996094 | 17 |
| 282.9402770996094 | 12 |
| 112.26982116699219 | 19 |
| 53.9301643371582 | 19 |
| 282.9402770996094 | 22 |
| 684.7071533203125 | 13 |
| 67.7122573852539 | 16 |
| 425.45751953125 | 20 |
| 467.41363525390625 | 14 |
| 70.3743667602539 | 16 |
| 523.3087768554688 | 17 |
| 111.36756896972656 | 20 |
| 10.967745780944824 | 15 |
| 496.5558166503906 | 9 |
| 684.7071533203125 | 12 |
| 123.18260192871094 | 17 |
| 109.85160827636719 | 11 |
| 467.41363525390625 | 11 |
| 131.16165161132812 | 21 |
| 352.53839111328125 | 17 |
| 626.5042724609375 | 24 |
| 626.5042724609375 | 21 |
| 308.56011962890625 | 22 |
| 339.0152282714844 | 24 |
| 318.1669921875 | 23 |
| 327.4113464355469 | 21 |
| 327.4113464355469 | 23 |
| 115.67255401611328 | 20 |
| 93.2790756225586 | 14 |
| 85.4575424194336 | 13 |
| 85.4575424194336 | 18 |
| 60.099365234375 | 13 |
| 95.96871185302734 | 18 |
| 121.11125946044922 | 18 |
| 115.2046890258789 | 17 |
| 115.67255401611328 | 15 |
| 135.36578369140625 | 20 |
| 123.47281646728516 | 17 |
| 41.679561614990234 | 20 |
| 28.70282554626465 | 17 |
| 109.99833679199219 | 13 |
| 207.1109619140625 | 12 |
| 96.96511840820312 | 15 |
| 20.841800689697266 | 18 |
| 67.06525421142578 | 12 |
| 99.9288330078125 | 18 |
| 57.32216262817383 | 17 |
| 17.13817596435547 | 18 |
| 59.49094772338867 | 10 |
| 57.32216262817383 | 16 |
| 71.74577331542969 | 19 |
| 51.07764434814453 | 13 |
| 74.14796447753906 | 20 |
| 57.32216262817383 | 11 |
| 21.500093460083008 | 12 |
| 104.47846221923828 | 17 |
| 103.03125762939453 | 15 |
| 38.496612548828125 | 13 |
| 416.7880554199219 | 13 |
| 200.4091339111328 | 14 |
| 113.28559875488281 | 18 |
| 152.04071044921875 | 17 |
| 393.3943786621094 | 17 |
| 16.898094177246094 | 22 |
| 54.01841735839844 | 15 |
| 130.21986389160156 | 22 |
| 184.49107360839844 | 20 |
| 393.3943786621094 | 17 |
| 155.5850830078125 | 16 |
| 154.38931274414062 | 21 |
| 66.97071075439453 | 25 |
| 155.5850830078125 | 9 |
| 155.5850830078125 | 18 |
| 18.896957397460938 | 18 |
| 147.95199584960938 | 14 |
| 155.5850830078125 | 19 |
| 798.2508544921875 | 14 |
| 63.7237548828125 | 11 |
| 487.5135803222656 | 19 |
| 556.5323486328125 | 16 |
| 62.93451690673828 | 17 |
| 570.9527587890625 | 16 |
| 82.14270782470703 | 20 |
| 131.31683349609375 | 19 |
| 561.6946411132812 | 16 |
| 798.2508544921875 | 12 |
| 24.948400497436523 | 16 |
| 224.3987274169922 | 18 |
| 556.5323486328125 | 16 |
| 0.0 | 10 |
| 409.5479431152344 | 12 |
| 131.16165161132812 | 19 |
| 577.3297729492188 | 21 |
| 577.3297729492188 | 19 |
| 241.0909881591797 | 24 |
| 270.3910217285156 | 22 |
| 237.78981018066406 | 25 |
| 244.18377685546875 | 22 |
| 244.18377685546875 | 24 |
| 230.5709686279297 | 21 |
| 209.85601806640625 | 15 |
| 99.80443572998047 | 16 |
| 99.80443572998047 | 16 |
| 144.03265380859375 | 14 |
| 221.8399658203125 | 20 |
| 234.82733154296875 | 15 |
| 229.44293212890625 | 18 |
| 230.5709686279297 | 17 |
| 6.048202991485596 | 20 |
| 249.53648376464844 | 17 |
| 160.66403198242188 | 21 |
| 137.22511291503906 | 16 |
| 238.21044921875 | 12 |
| 333.5183410644531 | 14 |
| 48.27854537963867 | 20 |
| 118.31144714355469 | 14 |
| 63.400550842285156 | 13 |
| 53.27190399169922 | 16 |
| 124.50663757324219 | 18 |
| 120.91043090820312 | 18 |
| 104.58120727539062 | 13 |
| 124.50663757324219 | 16 |
| 59.482635498046875 | 17 |
| 104.0997085571289 | 12 |
| 60.779850006103516 | 20 |
| 124.50663757324219 | 11 |
| 151.65745544433594 | 12 |
| 36.443355560302734 | 18 |
| 104.2557144165039 | 14 |
| 120.58959197998047 | 15 |
| 327.09051513671875 | 13 |
| 328.5474853515625 | 15 |
| 225.9936981201172 | 18 |
| 281.6666564941406 | 14 |
| 303.0071105957031 | 19 |
| 146.95367431640625 | 18 |
| 144.99208068847656 | 15 |
| 0.0 | 19 |
| 74.17814636230469 | 20 |
| 303.0071105957031 | 20 |
| 279.81097412109375 | 16 |
| 41.651180267333984 | 18 |
| 63.418609619140625 | 25 |
| 279.81097412109375 | 9 |
| 279.81097412109375 | 15 |
| 111.44709777832031 | 17 |
| 43.28995132446289 | 17 |
| 279.81097412109375 | 19 |
| 691.8775634765625 | 13 |
| 66.51612091064453 | 9 |
| 436.24542236328125 | 19 |
| 477.05609130859375 | 16 |
| 67.96094512939453 | 18 |
| 534.2997436523438 | 16 |
| 103.70905303955078 | 18 |
| 1.1037620306015015 | 20 |
| 507.2123107910156 | 13 |
| 691.8775634765625 | 10 |
| 120.22775268554688 | 15 |
| 118.58614349365234 | 16 |
| 477.05609130859375 | 15 |
| 130.21986389160156 | 10 |
| 363.4830322265625 | 13 |
| 11.08303165435791 | 17 |
| 130.21986389160156 | 7 |
| 268.8327941894531 | 21 |
| 268.8327941894531 | 19 |
| 89.56414031982422 | 20 |
| 60.28169631958008 | 25 |
| 83.1258316040039 | 23 |
| 77.1415023803711 | 21 |
| 77.1415023803711 | 21 |
| 420.2697448730469 | 12 |
| 413.2922058105469 | 11 |
| 312.2743835449219 | 10 |
| 312.2743835449219 | 12 |
| 357.2330017089844 | 13 |
| 441.40771484375 | 19 |
| 420.0056457519531 | 18 |
| 418.35760498046875 | 15 |
| 420.2697448730469 | 11 |
| 315.686767578125 | 20 |
| 511.8929443359375 | 15 |
| 439.0846252441406 | 15 |
| 421.0277404785156 | 17 |
| 461.1541748046875 | 12 |
| 523.2872924804688 | 12 |
| 315.1889343261719 | 18 |
| 376.712158203125 | 17 |
| 350.984619140625 | 14 |
| 308.6832275390625 | 14 |
| 346.6095275878906 | 17 |
| 380.4908447265625 | 18 |
| 409.858154296875 | 14 |
| 346.6095275878906 | 14 |
| 345.1197814941406 | 10 |
| 405.07379150390625 | 15 |
| 337.0805358886719 | 20 |
| 346.6095275878906 | 14 |
| 411.41802978515625 | 17 |
| 354.5215148925781 | 12 |
| 295.0763854980469 | 13 |
| 414.0712585449219 | 16 |
| 49.29819107055664 | 15 |
| 529.0000610351562 | 17 |
| 413.6543273925781 | 16 |
| 525.0283203125 | 18 |
| 49.83283996582031 | 16 |
| 407.51251220703125 | 19 |
| 440.5589294433594 | 15 |
| 320.88238525390625 | 19 |
| 359.71832275390625 | 18 |
| 49.83283996582031 | 18 |
| 544.5665283203125 | 19 |
| 346.232421875 | 20 |
| 351.565185546875 | 16 |
| 544.5665283203125 | 11 |
| 544.5665283203125 | 15 |
| 383.15008544921875 | 22 |
| 353.8523254394531 | 14 |
| 544.5665283203125 | 17 |
| 422.0971374511719 | 14 |
| 355.2099609375 | 11 |
| 137.77276611328125 | 14 |
| 159.24945068359375 | 16 |
| 362.1358947753906 | 14 |
| 247.1760711669922 | 17 |
| 417.86065673828125 | 16 |
| 320.27471923828125 | 20 |
| 196.48487854003906 | 14 |
| 422.0971374511719 | 15 |
| 405.54345703125 | 15 |
| 206.14498901367188 | 14 |
| 159.24945068359375 | 15 |
| 397.4587097167969 | 15 |
| 102.61961364746094 | 17 |
| 310.84320068359375 | 17 |
| 397.4587097167969 | 13 |
| 320.88238525390625 | 13 |
| 576.904296875 | 24 |
| 576.904296875 | 19 |
| 240.6249237060547 | 22 |
| 269.89044189453125 | 25 |
| 237.1905059814453 | 25 |
| 243.54957580566406 | 21 |
| 243.54957580566406 | 24 |
| 231.56764221191406 | 22 |
| 210.87030029296875 | 15 |
| 100.55481719970703 | 17 |
| 100.55481719970703 | 18 |
| 144.97933959960938 | 13 |
| 222.9010009765625 | 20 |
| 235.81568908691406 | 17 |
| 230.43638610839844 | 22 |
| 231.56764221191406 | 19 |
| 5.07924222946167 | 23 |
| 250.63792419433594 | 21 |
| 161.76377868652344 | 20 |
| 138.32371520996094 | 18 |
| 239.28515625 | 15 |
| 334.5724182128906 | 18 |
| 49.071128845214844 | 19 |
| 119.38134765625 | 14 |
| 64.48779296875 | 17 |
| 53.96741485595703 | 15 |
| 125.44120788574219 | 16 |
| 121.9863052368164 | 20 |
| 105.61774444580078 | 16 |
| 125.44120788574219 | 16 |
| 60.55326843261719 | 19 |
| 105.16455841064453 | 16 |
| 61.79590606689453 | 15 |
| 125.44120788574219 | 17 |
| 152.75291442871094 | 17 |
| 37.37723159790039 | 17 |
| 104.8600082397461 | 17 |
| 121.67427825927734 | 19 |
| 326.3508605957031 | 15 |
| 329.61676025390625 | 15 |
| 226.980224609375 | 19 |
| 282.76947021484375 | 15 |
| 302.2690124511719 | 19 |
| 148.04840087890625 | 22 |
| 146.0564727783203 | 11 |
| 1.1037620306015015 | 22 |
| 73.62529754638672 | 22 |
| 302.2690124511719 | 17 |
| 280.90771484375 | 19 |
| 41.25190353393555 | 20 |
| 64.50782012939453 | 25 |
| 280.90771484375 | 14 |
| 280.90771484375 | 18 |
| 112.54170989990234 | 21 |
| 43.1243896484375 | 19 |
| 280.90771484375 | 23 |
| 690.93994140625 | 16 |
| 67.61090087890625 | 12 |
| 435.83447265625 | 17 |
| 476.3765563964844 | 15 |
| 69.06460571289062 | 17 |
| 533.9937133789062 | 16 |
| 104.63963317871094 | 20 |
| 0.0 | 21 |
| 506.7535400390625 | 19 |
| 690.93994140625 | 14 |
| 121.32872772216797 | 17 |
| 117.80614471435547 | 16 |
| 476.3765563964844 | 15 |
| 131.31683349609375 | 15 |
| 363.14776611328125 | 14 |
| 10.967745780944824 | 19 |
| 131.31683349609375 | 11 |
| 1.1037620306015015 | 10 |
| 320.27471923828125 | 17 |
| 636.1835327148438 | 24 |
| 636.1835327148438 | 24 |
| 304.6234130859375 | 24 |
| 334.9864196777344 | 28 |
| 306.8030090332031 | 21 |
| 314.4483947753906 | 23 |
| 314.4483947753906 | 22 |
| 186.07318115234375 | 19 |
| 163.7085418701172 | 19 |
| 103.6407241821289 | 22 |
| 103.6407241821289 | 20 |
| 115.26384735107422 | 19 |
| 166.24343872070312 | 17 |
| 191.37875366210938 | 15 |
| 185.4983673095703 | 22 |
| 186.07318115234375 | 19 |
| 86.08538818359375 | 23 |
| 175.31906127929688 | 22 |
| 87.3629150390625 | 20 |
| 64.53407287597656 | 23 |
| 178.83001708984375 | 16 |
| 276.2223205566406 | 23 |
| 75.24217224121094 | 25 |
| 71.65557861328125 | 20 |
| 42.64581298828125 | 21 |
| 82.50042724609375 | 15 |
| 101.3180923461914 | 24 |
| 71.83012390136719 | 26 |
| 24.693374633789062 | 22 |
| 101.3180923461914 | 18 |
| 47.534732818603516 | 17 |
| 26.270000457763672 | 15 |
| 56.94443893432617 | 21 |
| 101.3180923461914 | 15 |
| 90.44099426269531 | 18 |
| 44.75407791137695 | 21 |
| 118.75479125976562 | 23 |
| 44.89194869995117 | 20 |
| 400.6415710449219 | 16 |
| 268.3079528808594 | 20 |
| 183.28692626953125 | 20 |
| 211.330810546875 | 25 |
| 376.6054992675781 | 18 |
| 86.57146453857422 | 20 |
| 66.10514068603516 | 18 |
| 80.051025390625 | 23 |
| 116.85516357421875 | 27 |
| 376.6054992675781 | 24 |
| 203.7989501953125 | 21 |
| 90.19779968261719 | 21 |
| 41.965423583984375 | 28 |
| 203.7989501953125 | 18 |
| 203.7989501953125 | 16 |
| 57.301597595214844 | 16 |
| 82.26010131835938 | 22 |
| 203.7989501953125 | 21 |
| 770.8712768554688 | 14 |
| 39.37578201293945 | 19 |
| 495.1233825683594 | 22 |
| 547.8621215820312 | 15 |
| 31.526578903198242 | 21 |
| 587.1080932617188 | 16 |
| 29.141817092895508 | 22 |
| 81.07562255859375 | 18 |
| 568.0348510742188 | 13 |
| 770.8712768554688 | 11 |
| 50.44413375854492 | 19 |
| 194.84463500976562 | 15 |
| 547.8621215820312 | 16 |
| 70.8581314086914 | 18 |
| 419.2044982910156 | 18 |
| 86.256103515625 | 13 |
| 70.8581314086914 | 16 |
| 80.051025390625 | 15 |
| 389.4775390625 | 22 |
| 81.07562255859375 | 17 |
| 636.0422973632812 | 23 |
| 636.0422973632812 | 20 |
| 302.9697570800781 | 25 |
| 328.8177795410156 | 27 |
| 290.1037902832031 | 28 |
| 293.32867431640625 | 24 |
| 293.32867431640625 | 23 |
| 318.7867431640625 | 25 |
| 296.94757080078125 | 24 |
| 197.03245544433594 | 16 |
| 197.03245544433594 | 13 |
| 236.36476135253906 | 15 |
| 303.4523620605469 | 18 |
| 323.6028747558594 | 20 |
| 317.9117126464844 | 21 |
| 318.7867431640625 | 18 |
| 97.09371185302734 | 25 |
| 310.69439697265625 | 23 |
| 225.19898986816406 | 21 |
| 203.0382843017578 | 23 |
| 317.10577392578125 | 17 |
| 414.45751953125 | 19 |
| 145.41648864746094 | 21 |
| 202.14979553222656 | 18 |
| 149.04058837890625 | 20 |
| 150.9332733154297 | 15 |
| 217.6517333984375 | 21 |
| 203.71112060546875 | 25 |
| 159.43775939941406 | 19 |
| 217.6517333984375 | 18 |
| 147.60166931152344 | 13 |
| 164.1795654296875 | 17 |
| 152.50442504882812 | 24 |
| 217.6517333984375 | 16 |
| 228.234375 | 15 |
| 105.21004486083984 | 17 |
| 202.0102996826172 | 19 |
| 182.95953369140625 | 18 |
| 362.900146484375 | 13 |
| 406.9754638671875 | 21 |
| 314.99749755859375 | 18 |
| 348.8023681640625 | 19 |
| 339.8670349121094 | 19 |
| 224.04376220703125 | 17 |
| 199.21331787109375 | 21 |
| 97.76567840576172 | 16 |
| 24.225048065185547 | 22 |
| 339.8670349121094 | 21 |
| 336.5312194824219 | 22 |
| 57.73686981201172 | 20 |
| 148.7332000732422 | 23 |
| 336.5312194824219 | 17 |
| 336.5312194824219 | 19 |
| 190.88121032714844 | 19 |
| 61.21910095214844 | 19 |
| 336.5312194824219 | 26 |
| 694.7921752929688 | 14 |
| 150.3443603515625 | 13 |
| 497.4655456542969 | 23 |
| 515.4109497070312 | 16 |
| 147.59910583496094 | 15 |
| 601.46484375 | 20 |
| 144.30943298339844 | 18 |
| 97.15048217773438 | 18 |
| 564.131103515625 | 19 |
| 694.7921752929688 | 13 |
| 189.16815185546875 | 21 |
| 167.11163330078125 | 12 |
| 515.4109497070312 | 15 |
| 207.5155792236328 | 19 |
| 430.7161560058594 | 21 |
| 106.14266204833984 | 17 |
| 207.5155792236328 | 18 |
| 97.76567840576172 | 14 |
| 369.3193359375 | 17 |
| 97.15048217773438 | 18 |
| 138.79454040527344 | 19 |
| 260.76129150390625 | 27 |
| 260.76129150390625 | 25 |
| 104.64029693603516 | 26 |
| 92.59120178222656 | 28 |
| 131.9878387451172 | 30 |
| 136.96299743652344 | 23 |
| 136.96299743652344 | 27 |
| 356.99072265625 | 24 |
| 355.6393127441406 | 19 |
| 283.044921875 | 20 |
| 283.044921875 | 21 |
| 313.9343566894531 | 19 |
| 385.347900390625 | 21 |
| 355.2902526855469 | 21 |
| 355.099853515625 | 26 |
| 356.99072265625 | 24 |
| 323.4979248046875 | 20 |
| 464.9757995605469 | 23 |
| 406.3931579589844 | 27 |
| 393.0038146972656 | 24 |
| 403.9066162109375 | 18 |
| 449.199462890625 | 18 |
| 304.7561950683594 | 24 |
| 345.3795471191406 | 17 |
| 336.5343017578125 | 23 |
| 297.0910949707031 | 22 |
| 309.24969482421875 | 23 |
| 348.859130859375 | 28 |
| 394.3110046386719 | 19 |
| 309.24969482421875 | 21 |
| 331.3537292480469 | 19 |
| 387.603515625 | 21 |
| 322.0634765625 | 24 |
| 309.24969482421875 | 15 |
| 374.5519104003906 | 22 |
| 354.2360534667969 | 18 |
| 265.48443603515625 | 23 |
| 391.5732116699219 | 24 |
| 164.79750061035156 | 18 |
| 457.8500061035156 | 20 |
| 350.6856384277344 | 22 |
| 469.3023681640625 | 22 |
| 159.92515563964844 | 20 |
| 371.5624084472656 | 22 |
| 416.1763916015625 | 20 |
| 327.2668151855469 | 23 |
| 384.5606384277344 | 23 |
| 159.92515563964844 | 17 |
| 496.2638244628906 | 24 |
| 362.2194519042969 | 25 |
| 337.2008056640625 | 23 |
| 496.2638244628906 | 17 |
| 496.2638244628906 | 21 |
| 355.7469177246094 | 23 |
| 367.6830749511719 | 21 |
| 496.2638244628906 | 21 |
| 516.3160400390625 | 15 |
| 340.23828125 | 17 |
| 123.93607330322266 | 22 |
| 227.73655700683594 | 22 |
| 347.991455078125 | 19 |
| 208.33737182617188 | 19 |
| 407.9220275878906 | 26 |
| 327.02099609375 | 24 |
| 198.0306396484375 | 19 |
| 516.3160400390625 | 18 |
| 380.2931823730469 | 19 |
| 235.53497314453125 | 21 |
| 227.73655700683594 | 18 |
| 365.78253173828125 | 18 |
| 46.33661651611328 | 13 |
| 316.2134094238281 | 21 |
| 365.78253173828125 | 16 |
| 327.2668151855469 | 16 |
| 115.59415435791016 | 19 |
| 327.02099609375 | 18 |
| 378.8355712890625 | 25 |
| 400.2670593261719 | 21 |
| 76.77801513671875 | 23 |
| 76.77801513671875 | 22 |
| 298.4950866699219 | 24 |
| 273.6326599121094 | 17 |
| 314.3398742675781 | 22 |
| 313.6916198730469 | 19 |
| 313.6916198730469 | 18 |
| 546.3301391601562 | 19 |
| 549.1411743164062 | 16 |
| 489.9959716796875 | 14 |
| 489.9959716796875 | 16 |
| 516.3311157226562 | 15 |
| 578.8543701171875 | 20 |
| 543.5487670898438 | 14 |
| 544.5396728515625 | 17 |
| 546.3301391601562 | 15 |
| 530.2596435546875 | 16 |
| 662.0107421875 | 16 |
| 610.672607421875 | 17 |
| 598.7667236328125 | 16 |
| 595.978515625 | 16 |
| 624.0245971679688 | 13 |
| 513.08984375 | 22 |
| 550.9463500976562 | 16 |
| 544.7342529296875 | 15 |
| 505.42816162109375 | 14 |
| 513.8019409179688 | 18 |
| 554.2958984375 | 22 |
| 602.2024536132812 | 18 |
| 513.8019409179688 | 15 |
| 539.6016845703125 | 19 |
| 595.3198852539062 | 13 |
| 530.2798461914062 | 21 |
| 513.8019409179688 | 14 |
| 577.9583129882812 | 10 |
| 562.2415771484375 | 17 |
| 472.6312255859375 | 15 |
| 598.521240234375 | 18 |
| 279.7236022949219 | 13 |
| 635.633056640625 | 14 |
| 540.5479125976562 | 15 |
| 660.550048828125 | 21 |
| 293.18316650390625 | 18 |
| 575.3367309570312 | 20 |
| 622.5401611328125 | 16 |
| 534.2997436523438 | 21 |
| 587.7534790039062 | 21 |
| 293.18316650390625 | 20 |
| 691.8482055664062 | 18 |
| 567.669921875 | 19 |
| 545.4032592773438 | 25 |
| 691.8482055664062 | 10 |
| 691.8482055664062 | 14 |
| 562.09326171875 | 16 |
| 573.673828125 | 19 |
| 691.8482055664062 | 17 |
| 463.0831298828125 | 17 |
| 548.3956909179688 | 13 |
| 109.42603302001953 | 17 |
| 199.9594268798828 | 15 |
| 556.172119140625 | 19 |
| 0.0 | 10 |
| 616.171875 | 17 |
| 533.9937133789062 | 19 |
| 81.3782730102539 | 15 |
| 463.0831298828125 | 13 |
| 586.819091796875 | 17 |
| 434.3944091796875 | 19 |
| 199.9594268798828 | 17 |
| 570.9527587890625 | 13 |
| 171.26614379882812 | 15 |
| 523.3087768554688 | 19 |
| 570.9527587890625 | 14 |
| 534.2997436523438 | 13 |
| 247.1760711669922 | 16 |
| 533.9937133789062 | 19 |
| 587.1080932617188 | 15 |
| 601.46484375 | 17 |
| 208.33737182617188 | 20 |
| 257.09222412109375 | 21 |
| 257.09222412109375 | 20 |
| 245.47183227539062 | 25 |
| 218.82200622558594 | 26 |
| 227.70071411132812 | 26 |
| 217.66969299316406 | 16 |
| 217.66969299316406 | 24 |
| 577.7900390625 | 19 |
| 569.4641723632812 | 18 |
| 460.8735046386719 | 15 |
| 460.8735046386719 | 15 |
| 509.8411560058594 | 13 |
| 596.7805786132812 | 22 |
| 577.8465576171875 | 17 |
| 575.8897705078125 | 20 |
| 577.7900390625 | 18 |
| 443.06634521484375 | 20 |
| 663.0411987304688 | 17 |
| 585.1202392578125 | 20 |
| 565.1952514648438 | 17 |
| 616.6654052734375 | 12 |
| 682.3575439453125 | 15 |
| 454.3518371582031 | 18 |
| 523.87548828125 | 16 |
| 490.46539306640625 | 20 |
| 448.8932800292969 | 18 |
| 497.2877502441406 | 20 |
| 527.6727905273438 | 22 |
| 547.3709106445312 | 16 |
| 497.2877502441406 | 17 |
| 484.5059509277344 | 15 |
| 543.929443359375 | 18 |
| 477.5853271484375 | 21 |
| 497.2877502441406 | 11 |
| 560.108642578125 | 19 |
| 484.876953125 | 15 |
| 444.5672607421875 | 18 |
| 555.4857788085938 | 19 |
| 127.95233917236328 | 16 |
| 687.538330078125 | 21 |
| 571.16259765625 | 19 |
| 679.391845703125 | 20 |
| 150.84703063964844 | 16 |
| 555.8931884765625 | 20 |
| 582.1719360351562 | 11 |
| 448.8777160644531 | 24 |
| 469.3831787109375 | 16 |
| 150.84703063964844 | 17 |
| 695.8706665039062 | 19 |
| 464.81280517578125 | 18 |
| 490.96795654296875 | 21 |
| 695.8706665039062 | 11 |
| 695.8706665039062 | 15 |
| 528.2146606445312 | 15 |
| 473.6229248046875 | 16 |
| 695.8706665039062 | 18 |
| 262.2209777832031 | 15 |
| 494.7811584472656 | 17 |
| 200.0485382080078 | 17 |
| 85.1433334350586 | 16 |
| 500.89532470703125 | 18 |
| 281.8938903808594 | 16 |
| 551.4816284179688 | 21 |
| 448.05780029296875 | 19 |
| 201.9900665283203 | 18 |
| 262.2209777832031 | 16 |
| 548.744140625 | 14 |
| 330.4931640625 | 16 |
| 85.1433334350586 | 10 |
| 544.1439819335938 | 15 |
| 227.3341827392578 | 13 |
| 440.3420104980469 | 18 |
| 544.1439819335938 | 13 |
| 448.8777160644531 | 14 |
| 159.97335815429688 | 14 |
| 448.05780029296875 | 15 |
| 524.8143920898438 | 19 |
| 472.2297668457031 | 19 |
| 260.84356689453125 | 14 |
| 281.8938903808594 | 16 |
| 257.09222412109375 | 22 |
| 257.09222412109375 | 24 |
| 245.47183227539062 | 24 |
| 218.82200622558594 | 23 |
| 227.70071411132812 | 26 |
| 217.66969299316406 | 19 |
| 217.66969299316406 | 20 |
| 577.7900390625 | 19 |
| 569.4641723632812 | 19 |
| 460.8735046386719 | 20 |
| 460.8735046386719 | 18 |
| 509.8411560058594 | 17 |
| 596.7805786132812 | 16 |
| 577.8465576171875 | 18 |
| 575.8897705078125 | 23 |
| 577.7900390625 | 20 |
| 443.06634521484375 | 22 |
| 663.0411987304688 | 18 |
| 585.1202392578125 | 23 |
| 565.1952514648438 | 19 |
| 616.6654052734375 | 17 |
| 682.3575439453125 | 22 |
| 454.3518371582031 | 21 |
| 523.87548828125 | 20 |
| 490.46539306640625 | 20 |
| 448.8932800292969 | 18 |
| 497.2877502441406 | 20 |
| 527.6727905273438 | 20 |
| 547.3709106445312 | 19 |
| 497.2877502441406 | 18 |
| 484.5059509277344 | 21 |
| 543.929443359375 | 19 |
| 477.5853271484375 | 17 |
| 497.2877502441406 | 17 |
| 560.108642578125 | 21 |
| 484.876953125 | 17 |
| 444.5672607421875 | 21 |
| 555.4857788085938 | 22 |
| 127.95233917236328 | 20 |
| 687.538330078125 | 17 |
| 571.16259765625 | 17 |
| 679.391845703125 | 22 |
| 150.84703063964844 | 18 |
| 555.8931884765625 | 22 |
| 582.1719360351562 | 19 |
| 448.8777160644531 | 23 |
| 469.3831787109375 | 22 |
| 150.84703063964844 | 22 |
| 695.8706665039062 | 18 |
| 464.81280517578125 | 18 |
| 490.96795654296875 | 15 |
| 695.8706665039062 | 19 |
| 695.8706665039062 | 16 |
| 528.2146606445312 | 21 |
| 473.6229248046875 | 21 |
| 695.8706665039062 | 15 |
| 262.2209777832031 | 19 |
| 494.7811584472656 | 18 |
| 200.0485382080078 | 18 |
| 85.1433334350586 | 21 |
| 500.89532470703125 | 20 |
| 281.8938903808594 | 17 |
| 551.4816284179688 | 15 |
| 448.05780029296875 | 19 |
| 201.9900665283203 | 19 |
| 262.2209777832031 | 13 |
| 548.744140625 | 17 |
| 330.4931640625 | 14 |
| 85.1433334350586 | 18 |
| 544.1439819335938 | 22 |
| 227.3341827392578 | 19 |
| 440.3420104980469 | 19 |
| 544.1439819335938 | 21 |
| 448.8777160644531 | 18 |
| 159.97335815429688 | 20 |
| 448.05780029296875 | 20 |
| 524.8143920898438 | 21 |
| 472.2297668457031 | 20 |
| 260.84356689453125 | 18 |
| 281.8938903808594 | 17 |
| 0.0 | 20 |
| 558.5606079101562 | 21 |
| 558.5606079101562 | 20 |
| 228.08200073242188 | 21 |
| 258.5917053222656 | 20 |
| 232.46238708496094 | 21 |
| 240.78244018554688 | 16 |
| 240.78244018554688 | 18 |
| 179.5960235595703 | 17 |
| 160.00425720214844 | 15 |
| 44.72671890258789 | 13 |
| 44.72671890258789 | 12 |
| 91.53717041015625 | 14 |
| 175.73776245117188 | 17 |
| 183.4293670654297 | 17 |
| 178.31423950195312 | 16 |
| 179.5960235595703 | 11 |
| 57.40324020385742 | 14 |
| 217.3019256591797 | 17 |
| 132.23789978027344 | 18 |
| 110.89348602294922 | 15 |
| 193.64466857910156 | 11 |
| 285.9390563964844 | 13 |
| 6.914251327514648 | 14 |
| 76.42623901367188 | 14 |
| 36.693424224853516 | 13 |
| 6.158340930938721 | 13 |
| 71.80465698242188 | 15 |
| 79.86582946777344 | 22 |
| 95.80502319335938 | 11 |
| 71.80465698242188 | 13 |
| 30.92150115966797 | 15 |
| 90.72913360595703 | 13 |
| 22.80573081970215 | 17 |
| 71.80465698242188 | 12 |
| 113.50434112548828 | 9 |
| 59.389198303222656 | 14 |
| 51.52552032470703 | 16 |
| 100.64398193359375 | 15 |
| 328.7919616699219 | 12 |
| 282.58831787109375 | 15 |
| 174.55398559570312 | 16 |
| 244.1044158935547 | 15 |
| 304.9781494140625 | 15 |
| 108.78223419189453 | 18 |
| 127.33847045898438 | 12 |
| 55.16825866699219 | 19 |
| 128.35299682617188 | 17 |
| 304.9781494140625 | 16 |
| 249.3850860595703 | 15 |
| 94.9339599609375 | 18 |
| 37.29362869262695 | 22 |
| 249.3850860595703 | 9 |
| 249.3850860595703 | 14 |
| 75.79861450195312 | 18 |
| 93.85498809814453 | 13 |
| 249.3850860595703 | 16 |
| 706.3038330078125 | 14 |
| 40.879398345947266 | 10 |
| 417.5247802734375 | 16 |
| 473.3560791015625 | 18 |
| 48.02204895019531 | 14 |
| 509.7915344238281 | 18 |
| 106.77140808105469 | 18 |
| 55.9514274597168 | 19 |
| 490.5328674316406 | 14 |
| 706.3038330078125 | 13 |
| 94.05760955810547 | 11 |
| 130.7447509765625 | 16 |
| 473.3560791015625 | 10 |
| 93.83492279052734 | 11 |
| 341.58575439453125 | 14 |
| 49.40983200073242 | 16 |
| 93.83492279052734 | 9 |
| 55.16825866699219 | 12 |
| 314.3495788574219 | 13 |
| 55.9514274597168 | 14 |
| 77.63041687011719 | 20 |
| 152.3249053955078 | 17 |
| 301.4635009765625 | 16 |
| 509.7915344238281 | 14 |
| 454.93182373046875 | 12 |
| 454.93182373046875 | 18 |
| 601.9627685546875 | 26 |
| 601.9627685546875 | 23 |
| 289.26348876953125 | 26 |
| 319.439208984375 | 26 |
| 301.23388671875 | 23 |
| 310.92950439453125 | 24 |
| 310.92950439453125 | 25 |
| 97.18201446533203 | 22 |
| 75.40800476074219 | 20 |
| 67.7073974609375 | 19 |
| 67.7073974609375 | 20 |
| 30.989131927490234 | 17 |
| 86.63388061523438 | 21 |
| 102.0610580444336 | 18 |
| 96.33121490478516 | 17 |
| 97.18201446533203 | 16 |
| 139.96917724609375 | 26 |
| 134.68212890625 | 20 |
| 65.60540771484375 | 25 |
| 57.59170150756836 | 22 |
| 104.08940887451172 | 19 |
| 197.98558044433594 | 15 |
| 94.48809814453125 | 22 |
| 19.966001510620117 | 19 |
| 73.59806060791016 | 12 |
| 95.1619644165039 | 20 |
| 32.44736099243164 | 21 |
| 19.65104103088379 | 20 |
| 85.35784149169922 | 16 |
| 32.44736099243164 | 17 |
| 76.4709243774414 | 19 |
| 76.54456329345703 | 18 |
| 75.15607452392578 | 25 |
| 32.44736099243164 | 15 |
| 33.44013595581055 | 13 |
| 116.45716094970703 | 17 |
| 83.99237060546875 | 15 |
| 66.8614273071289 | 11 |
| 400.6474914550781 | 14 |
| 193.62094116210938 | 17 |
| 93.5475082397461 | 17 |
| 156.364990234375 | 19 |
| 377.65350341796875 | 21 |
| 30.3317813873291 | 22 |
| 83.01199340820312 | 21 |
| 135.61288452148438 | 23 |
| 197.81312561035156 | 25 |
| 377.65350341796875 | 21 |
| 167.50454711914062 | 18 |
| 165.81683349609375 | 19 |
| 73.77947998046875 | 30 |
| 167.50454711914062 | 13 |
| 167.50454711914062 | 19 |
| 34.328495025634766 | 19 |
| 160.63807678222656 | 25 |
| 167.50454711914062 | 24 |
| 784.9130249023438 | 17 |
| 71.63819122314453 | 12 |
| 463.80706787109375 | 24 |
| 537.2119750976562 | 13 |
| 74.02958679199219 | 18 |
| 545.09033203125 | 20 |
| 107.86311340332031 | 21 |
| 136.658203125 | 25 |
| 538.0979614257812 | 18 |
| 784.9130249023438 | 15 |
| 52.96419143676758 | 18 |
| 216.1659393310547 | 19 |
| 537.2119750976562 | 15 |
| 29.22976303100586 | 15 |
| 385.6253967285156 | 20 |
| 134.14036560058594 | 16 |
| 29.22976303100586 | 12 |
| 135.61288452148438 | 12 |
| 378.6832580566406 | 17 |
| 136.658203125 | 18 |
| 91.42475891113281 | 17 |
| 221.609130859375 | 14 |
| 341.23779296875 | 23 |
| 545.09033203125 | 15 |
| 528.4751586914062 | 17 |
| 528.4751586914062 | 21 |
| 89.62051391601562 | 16 |
| 641.1315307617188 | 23 |
| 641.1315307617188 | 22 |
| 314.6453857421875 | 18 |
| 345.2322692871094 | 22 |
| 320.0989990234375 | 18 |
| 328.4822692871094 | 25 |
| 328.4822692871094 | 28 |
| 156.23397827148438 | 21 |
| 133.8565216064453 | 21 |
| 99.14342498779297 | 24 |
| 99.14342498779297 | 23 |
| 94.33304595947266 | 20 |
| 134.14886474609375 | 20 |
| 161.7273712158203 | 17 |
| 155.81639099121094 | 23 |
| 156.23397827148438 | 22 |
| 112.57369995117188 | 24 |
| 143.84814453125 | 22 |
| 55.08501052856445 | 23 |
| 31.791847229003906 | 23 |
| 146.09011840820312 | 19 |
| 243.43258666992188 | 23 |
| 87.90699768066406 | 25 |
| 48.4088020324707 | 23 |
| 51.81222915649414 | 23 |
| 93.61161804199219 | 20 |
| 84.75079345703125 | 25 |
| 47.121360778808594 | 21 |
| 19.18876838684082 | 22 |
| 84.75079345703125 | 20 |
| 57.767372131347656 | 22 |
| 10.436293601989746 | 21 |
| 64.90624237060547 | 26 |
| 84.75079345703125 | 14 |
| 58.45115280151367 | 20 |
| 74.51346588134766 | 23 |
| 116.3386001586914 | 25 |
| 13.943206787109375 | 21 |
| 416.4246520996094 | 18 |
| 235.312255859375 | 23 |
| 153.98452758789062 | 22 |
| 178.7698974609375 | 27 |
| 392.57110595703125 | 20 |
| 54.97184371948242 | 19 |
| 40.096435546875 | 21 |
| 106.75157165527344 | 27 |
| 149.8799591064453 | 26 |
| 392.57110595703125 | 23 |
| 173.3587188720703 | 24 |
| 122.43132019042969 | 23 |
| 51.32627868652344 | 24 |
| 173.3587188720703 | 19 |
| 173.3587188720703 | 18 |
| 33.08952713012695 | 18 |
| 114.84286499023438 | 21 |
| 173.3587188720703 | 24 |
| 791.880126953125 | 15 |
| 47.49612808227539 | 20 |
| 500.7410888671875 | 22 |
| 560.84228515625 | 23 |
| 41.88249969482422 | 22 |
| 588.9527587890625 | 24 |
| 41.78326416015625 | 25 |
| 107.83922576904297 | 22 |
| 574.3951416015625 | 16 |
| 791.880126953125 | 16 |
| 17.64076805114746 | 15 |
| 214.939453125 | 20 |
| 560.84228515625 | 15 |
| 40.748207092285156 | 16 |
| 423.6523742675781 | 23 |
| 110.80197143554688 | 19 |
| 40.748207092285156 | 19 |
| 106.75157165527344 | 18 |
| 401.7131652832031 | 22 |
| 107.83922576904297 | 21 |
| 33.08108901977539 | 16 |
| 171.87278747558594 | 23 |
| 381.55133056640625 | 24 |
| 588.9527587890625 | 22 |
| 542.2562866210938 | 19 |
| 542.2562866210938 | 25 |
| 87.7078628540039 | 18 |
| 66.17120361328125 | 21 |
| 57.71403503417969 | 24 |
| 57.71403503417969 | 20 |
| 287.7424011230469 | 24 |
| 258.4947509765625 | 25 |
| 294.2217102050781 | 27 |
| 290.38287353515625 | 21 |
| 290.38287353515625 | 24 |
| 578.4532470703125 | 21 |
| 577.851806640625 | 17 |
| 500.9778747558594 | 10 |
| 500.9778747558594 | 16 |
| 535.5361938476562 | 12 |
| 607.604736328125 | 18 |
| 576.4826049804688 | 17 |
| 576.5790405273438 | 17 |
| 578.4532470703125 | 15 |
| 524.03173828125 | 20 |
| 687.359130859375 | 17 |
| 626.5446166992188 | 13 |
| 611.79638671875 | 17 |
| 626.0076293945312 | 14 |
| 666.203369140625 | 13 |
| 515.419921875 | 14 |
| 564.7028198242188 | 16 |
| 549.5928344726562 | 15 |
| 508.18048095703125 | 13 |
| 529.7164306640625 | 13 |
| 568.2967529296875 | 18 |
| 608.5420532226562 | 10 |
| 529.7164306640625 | 15 |
| 544.0275268554688 | 16 |
| 602.5795288085938 | 14 |
| 535.164306640625 | 18 |
| 529.7164306640625 | 14 |
| 595.4248657226562 | 16 |
| 560.2213134765625 | 16 |
| 483.2414855957031 | 18 |
| 608.5322875976562 | 15 |
| 233.16128540039062 | 13 |
| 676.0892944335938 | 15 |
| 572.24560546875 | 18 |
| 691.3828125 | 14 |
| 251.97967529296875 | 17 |
| 592.226318359375 | 22 |
| 633.9994506835938 | 14 |
| 528.7822875976562 | 22 |
| 573.1704711914062 | 18 |
| 251.97967529296875 | 19 |
| 718.6883544921875 | 22 |
| 557.5704345703125 | 19 |
| 550.22998046875 | 23 |
| 718.6883544921875 | 14 |
| 718.6883544921875 | 17 |
| 574.0134887695312 | 20 |
| 564.6596069335938 | 10 |
| 718.6883544921875 | 22 |
| 372.71063232421875 | 15 |
| 553.5814208984375 | 16 |
| 98.52579498291016 | 18 |
| 117.62090301513672 | 20 |
| 561.06787109375 | 17 |
| 90.98236083984375 | 15 |
| 619.7071533203125 | 18 |
| 528.2999877929688 | 18 |
| 24.773719787597656 | 18 |
| 372.71063232421875 | 15 |
| 598.1004028320312 | 17 |
| 418.5981140136719 | 17 |
| 117.62090301513672 | 15 |
| 585.380859375 | 15 |
| 176.76805114746094 | 14 |
| 518.2008666992188 | 20 |
| 585.380859375 | 10 |
| 528.7822875976562 | 13 |
| 214.79559326171875 | 16 |
| 528.2999877929688 | 12 |
| 590.6536865234375 | 22 |
| 583.6771850585938 | 15 |
| 222.42514038085938 | 17 |
| 90.98236083984375 | 15 |
| 202.62432861328125 | 12 |
| 202.62432861328125 | 20 |
| 513.2479248046875 | 10 |
| 561.9979248046875 | 20 |
| 597.541748046875 | 22 |
| 421.1092224121094 | 23 |
| 421.1092224121094 | 18 |
| 93.76893615722656 | 24 |
| 115.58063507080078 | 23 |
| 75.36448669433594 | 27 |
| 78.41775512695312 | 20 |
| 78.41775512695312 | 24 |
| 324.27618408203125 | 23 |
| 310.79541015625 | 19 |
| 189.93614196777344 | 17 |
| 189.93614196777344 | 15 |
| 243.94003295898438 | 15 |
| 334.5479431152344 | 17 |
| 325.9393005371094 | 16 |
| 322.5197448730469 | 20 |
| 324.27618408203125 | 18 |
| 164.66058349609375 | 22 |
| 390.7133483886719 | 17 |
| 308.3999938964844 | 19 |
| 287.41839599609375 | 16 |
| 354.23333740234375 | 15 |
| 434.3674621582031 | 20 |
| 175.3470001220703 | 19 |
| 249.11886596679688 | 14 |
| 211.24514770507812 | 19 |
| 170.40707397460938 | 16 |
| 228.1444091796875 | 16 |
| 252.85606384277344 | 20 |
| 267.56829833984375 | 14 |
| 228.1444091796875 | 14 |
| 205.30039978027344 | 16 |
| 264.303466796875 | 16 |
| 198.8585968017578 | 20 |
| 228.1444091796875 | 16 |
| 286.30633544921875 | 19 |
| 205.7222137451172 | 16 |
| 175.9647216796875 | 18 |
| 276.4844055175781 | 17 |
| 156.8242645263672 | 16 |
| 435.5810546875 | 15 |
| 317.8970642089844 | 18 |
| 412.54864501953125 | 15 |
| 132.7471466064453 | 17 |
| 281.8141174316406 | 20 |
| 303.0963439941406 | 14 |
| 170.2748565673828 | 21 |
| 204.673828125 | 18 |
| 132.7471466064453 | 19 |
| 423.34185791015625 | 18 |
| 191.9446258544922 | 15 |
| 211.72024536132812 | 23 |
| 423.34185791015625 | 15 |
| 423.34185791015625 | 16 |
| 251.4938507080078 | 18 |
| 199.9115447998047 | 19 |
| 423.34185791015625 | 22 |
| 529.8828125 | 13 |
| 215.5581512451172 | 14 |
| 283.28912353515625 | 15 |
| 307.5940856933594 | 18 |
| 221.4164276123047 | 15 |
| 389.1873474121094 | 15 |
| 271.848876953125 | 13 |
| 169.53045654296875 | 19 |
| 349.1563720703125 | 17 |
| 529.8828125 | 13 |
| 270.5799560546875 | 17 |
| 52.091392517089844 | 15 |
| 307.5940856933594 | 13 |
| 268.534423828125 | 16 |
| 220.728759765625 | 14 |
| 161.17218017578125 | 17 |
| 268.534423828125 | 14 |
| 170.2748565673828 | 11 |
| 155.06607055664062 | 16 |
| 169.53045654296875 | 11 |
| 244.97413635253906 | 20 |
| 214.97630310058594 | 11 |
| 197.91635131835938 | 18 |
| 389.1873474121094 | 16 |
| 279.8504333496094 | 13 |
| 279.8504333496094 | 17 |
| 176.53627014160156 | 14 |
| 256.85699462890625 | 17 |
| 263.0408630371094 | 22 |
| 368.7951965332031 | 8 |
| 636.1835327148438 | 21 |
| 636.1835327148438 | 25 |
| 304.6234130859375 | 24 |
| 334.9864196777344 | 27 |
| 306.8030090332031 | 26 |
| 314.4483947753906 | 24 |
| 314.4483947753906 | 30 |
| 186.07318115234375 | 20 |
| 163.7085418701172 | 19 |
| 103.6407241821289 | 20 |
| 103.6407241821289 | 19 |
| 115.26384735107422 | 23 |
| 166.24343872070312 | 27 |
| 191.37875366210938 | 20 |
| 185.4983673095703 | 26 |
| 186.07318115234375 | 25 |
| 86.08538818359375 | 24 |
| 175.31906127929688 | 19 |
| 87.3629150390625 | 26 |
| 64.53407287597656 | 20 |
| 178.83001708984375 | 18 |
| 276.2223205566406 | 25 |
| 75.24217224121094 | 25 |
| 71.65557861328125 | 24 |
| 42.64581298828125 | 21 |
| 82.50042724609375 | 20 |
| 101.3180923461914 | 23 |
| 71.83012390136719 | 25 |
| 24.693374633789062 | 24 |
| 101.3180923461914 | 18 |
| 47.534732818603516 | 22 |
| 26.270000457763672 | 19 |
| 56.94443893432617 | 20 |
| 101.3180923461914 | 22 |
| 90.44099426269531 | 23 |
| 44.75407791137695 | 19 |
| 118.75479125976562 | 24 |
| 44.89194869995117 | 23 |
| 400.6415710449219 | 23 |
| 268.3079528808594 | 24 |
| 183.28692626953125 | 24 |
| 211.330810546875 | 29 |
| 376.6054992675781 | 21 |
| 86.57146453857422 | 25 |
| 66.10514068603516 | 23 |
| 80.051025390625 | 27 |
| 116.85516357421875 | 26 |
| 376.6054992675781 | 28 |
| 203.7989501953125 | 20 |
| 90.19779968261719 | 23 |
| 41.965423583984375 | 28 |
| 203.7989501953125 | 17 |
| 203.7989501953125 | 16 |
| 57.301597595214844 | 19 |
| 82.26010131835938 | 25 |
| 203.7989501953125 | 23 |
| 770.8712768554688 | 27 |
| 39.37578201293945 | 23 |
| 495.1233825683594 | 20 |
| 547.8621215820312 | 23 |
| 31.526578903198242 | 26 |
| 587.1080932617188 | 25 |
| 29.141817092895508 | 28 |
| 81.07562255859375 | 25 |
| 568.0348510742188 | 21 |
| 770.8712768554688 | 20 |
| 50.44413375854492 | 23 |
| 194.84463500976562 | 17 |
| 547.8621215820312 | 18 |
| 70.8581314086914 | 25 |
| 419.2044982910156 | 26 |
| 86.256103515625 | 20 |
| 70.8581314086914 | 23 |
| 80.051025390625 | 20 |
| 389.4775390625 | 19 |
| 81.07562255859375 | 25 |
| 0.0 | 26 |
| 138.79454040527344 | 28 |
| 378.8355712890625 | 30 |
| 587.1080932617188 | 22 |
| 524.8143920898438 | 23 |
| 524.8143920898438 | 24 |
| 77.63041687011719 | 20 |
| 91.42475891113281 | 27 |
| 33.08108901977539 | 22 |
| 590.6536865234375 | 25 |
| 244.97413635253906 | 25 |
| 562.1663208007812 | 20 |
| 562.1663208007812 | 18 |
| 251.5023651123047 | 19 |
| 281.4333190917969 | 22 |
| 265.09515380859375 | 22 |
| 275.1015319824219 | 18 |
| 275.1015319824219 | 18 |
| 105.56694030761719 | 20 |
| 87.90289306640625 | 19 |
| 37.659698486328125 | 12 |
| 37.659698486328125 | 11 |
| 18.341777801513672 | 13 |
| 109.08084106445312 | 16 |
| 108.89739990234375 | 16 |
| 104.12712860107422 | 17 |
| 105.56694030761719 | 13 |
| 132.69012451171875 | 17 |
| 170.8795928955078 | 15 |
| 105.22530364990234 | 19 |
| 94.68247985839844 | 15 |
| 128.60963439941406 | 13 |
| 214.56881713867188 | 15 |
| 82.33040618896484 | 16 |
| 47.7590217590332 | 14 |
| 77.76068878173828 | 16 |
| 79.6910629272461 | 15 |
| 9.524856567382812 | 15 |
| 50.504493713378906 | 21 |
| 112.34639739990234 | 15 |
| 9.524856567382812 | 12 |
| 77.62262725830078 | 15 |
| 103.65725708007812 | 16 |
| 71.68265533447266 | 16 |
| 9.524856567382812 | 16 |
| 73.1465835571289 | 17 |
| 121.23908996582031 | 15 |
| 49.77518844604492 | 14 |
| 99.33126831054688 | 19 |
| 364.8061218261719 | 15 |
| 213.1940155029297 | 17 |
| 100.07037353515625 | 16 |
| 187.6640167236328 | 18 |
| 342.1807556152344 | 14 |
| 70.12648010253906 | 18 |
| 119.6548843383789 | 10 |
| 129.73126220703125 | 18 |
| 199.8883514404297 | 15 |
| 342.1807556152344 | 16 |
| 203.61599731445312 | 20 |
| 166.4581756591797 | 18 |
| 78.24903869628906 | 20 |
| 203.61599731445312 | 13 |
| 203.61599731445312 | 13 |
| 61.85263442993164 | 21 |
| 163.3302001953125 | 14 |
| 203.61599731445312 | 18 |
| 750.7405395507812 | 14 |
| 78.01700592041016 | 13 |
| 424.07574462890625 | 14 |
| 499.09246826171875 | 13 |
| 83.77745056152344 | 13 |
| 505.4725646972656 | 15 |
| 133.23193359375 | 19 |
| 130.62728881835938 | 16 |
| 498.3756408691406 | 12 |
| 750.7405395507812 | 15 |
| 85.87124633789062 | 13 |
| 189.3533935546875 | 17 |
| 499.09246826171875 | 15 |
| 66.13207244873047 | 15 |
| 345.87432861328125 | 15 |
| 125.08494567871094 | 14 |
| 66.13207244873047 | 12 |
| 129.73126220703125 | 16 |
| 341.05535888671875 | 14 |
| 130.62728881835938 | 14 |
| 110.38435363769531 | 19 |
| 224.1134033203125 | 19 |
| 301.4430236816406 | 16 |
| 505.4725646972656 | 16 |
| 492.757080078125 | 12 |
| 492.757080078125 | 20 |
| 75.82340240478516 | 11 |
| 39.796424865722656 | 20 |
| 94.2746353149414 | 21 |
| 522.3082275390625 | 14 |
| 225.73545837402344 | 15 |
| 110.38435363769531 | 25 |
| 76.77801513671875 | 24 |
| 76.77801513671875 | 23 |
| 298.4950866699219 | 23 |
| 273.6326599121094 | 22 |
| 314.3398742675781 | 24 |
| 313.6916198730469 | 19 |
| 313.6916198730469 | 25 |
| 546.3301391601562 | 19 |
| 549.1411743164062 | 16 |
| 489.9959716796875 | 17 |
| 489.9959716796875 | 14 |
| 516.3311157226562 | 14 |
| 578.8543701171875 | 20 |
| 543.5487670898438 | 16 |
| 544.5396728515625 | 21 |
| 546.3301391601562 | 20 |
| 530.2596435546875 | 23 |
| 662.0107421875 | 18 |
| 610.672607421875 | 16 |
| 598.7667236328125 | 15 |
| 595.978515625 | 14 |
| 624.0245971679688 | 20 |
| 513.08984375 | 19 |
| 550.9463500976562 | 19 |
| 544.7342529296875 | 19 |
| 505.42816162109375 | 17 |
| 513.8019409179688 | 18 |
| 554.2958984375 | 20 |
| 602.2024536132812 | 18 |
| 513.8019409179688 | 18 |
| 539.6016845703125 | 20 |
| 595.3198852539062 | 19 |
| 530.2798461914062 | 18 |
| 513.8019409179688 | 16 |
| 577.9583129882812 | 17 |
| 562.2415771484375 | 16 |
| 472.6312255859375 | 19 |
| 598.521240234375 | 21 |
| 279.7236022949219 | 18 |
| 635.633056640625 | 17 |
| 540.5479125976562 | 20 |
| 660.550048828125 | 20 |
| 293.18316650390625 | 21 |
| 575.3367309570312 | 22 |
| 622.5401611328125 | 16 |
| 534.2997436523438 | 21 |
| 587.7534790039062 | 19 |
| 293.18316650390625 | 22 |
| 691.8482055664062 | 18 |
| 567.669921875 | 21 |
| 545.4032592773438 | 21 |
| 691.8482055664062 | 15 |
| 691.8482055664062 | 15 |
| 562.09326171875 | 16 |
| 573.673828125 | 18 |
| 691.8482055664062 | 22 |
| 463.0831298828125 | 13 |
| 548.3956909179688 | 14 |
| 109.42603302001953 | 14 |
| 199.9594268798828 | 22 |
| 556.172119140625 | 21 |
| 0.0 | 18 |
| 616.171875 | 18 |
| 533.9937133789062 | 20 |
| 81.3782730102539 | 15 |
| 463.0831298828125 | 12 |
| 586.819091796875 | 16 |
| 434.3944091796875 | 13 |
| 199.9594268798828 | 13 |
| 570.9527587890625 | 18 |
| 171.26614379882812 | 20 |
| 523.3087768554688 | 18 |
| 570.9527587890625 | 18 |
| 534.2997436523438 | 13 |
| 247.1760711669922 | 15 |
| 533.9937133789062 | 16 |
| 587.1080932617188 | 21 |
| 601.46484375 | 17 |
| 208.33737182617188 | 21 |
| 0.0 | 19 |
| 281.8938903808594 | 16 |
| 281.8938903808594 | 16 |
| 509.7915344238281 | 14 |
| 545.09033203125 | 21 |
| 588.9527587890625 | 21 |
| 90.98236083984375 | 15 |
| 389.1873474121094 | 14 |
| 587.1080932617188 | 19 |
| 505.4725646972656 | 18 |
| 401.0015869140625 | 21 |
| 401.0015869140625 | 19 |
| 507.173095703125 | 20 |
| 481.0037536621094 | 25 |
| 487.2606506347656 | 21 |
| 476.71710205078125 | 21 |
| 476.71710205078125 | 21 |
| 839.0137329101562 | 16 |
| 829.8889770507812 | 17 |
| 717.2459716796875 | 16 |
| 717.2459716796875 | 15 |
| 768.2723388671875 | 13 |
| 856.6116943359375 | 18 |
| 839.2533569335938 | 13 |
| 837.1232299804688 | 20 |
| 839.0137329101562 | 18 |
| 685.86083984375 | 18 |
| 919.5089721679688 | 15 |
| 838.2827758789062 | 19 |
| 817.1891479492188 | 17 |
| 876.5310668945312 | 13 |
| 944.35205078125 | 19 |
| 704.803466796875 | 20 |
| 778.5560302734375 | 17 |
| 740.3206176757812 | 17 |
| 700.1583251953125 | 13 |
| 754.5869140625 | 19 |
| 782.322021484375 | 19 |
| 794.59423828125 | 19 |
| 754.5869140625 | 14 |
| 734.4231567382812 | 17 |
| 792.248046875 | 12 |
| 728.420166015625 | 16 |
| 754.5869140625 | 13 |
| 815.487548828125 | 19 |
| 728.3170776367188 | 15 |
| 701.6695556640625 | 16 |
| 805.5431518554688 | 17 |
| 388.1219787597656 | 13 |
| 949.24853515625 | 17 |
| 832.3892822265625 | 16 |
| 938.2474365234375 | 23 |
| 409.5183410644531 | 15 |
| 811.0900268554688 | 17 |
| 831.9651489257812 | 14 |
| 691.8775634765625 | 19 |
| 697.6193237304688 | 21 |
| 409.5183410644531 | 18 |
| 952.2849731445312 | 21 |
| 700.2406005859375 | 18 |
| 740.7576904296875 | 24 |
| 952.2849731445312 | 16 |
| 952.2849731445312 | 11 |
| 781.3649291992188 | 15 |
| 709.5484619140625 | 16 |
| 952.2849731445312 | 18 |
| 0.0 | 12 |
| 744.6089477539062 | 16 |
| 426.5465087890625 | 16 |
| 293.861328125 | 12 |
| 750.01611328125 | 18 |
| 463.0831298828125 | 13 |
| 795.5761108398438 | 18 |
| 690.93994140625 | 17 |
| 388.3296203613281 | 12 |
| 0.0 | 12 |
| 800.2465209960938 | 14 |
| 576.959228515625 | 11 |
| 293.861328125 | 16 |
| 798.2508544921875 | 17 |
| 477.10528564453125 | 16 |
| 684.7071533203125 | 13 |
| 798.2508544921875 | 14 |
| 691.8775634765625 | 15 |
| 422.0971374511719 | 18 |
| 690.93994140625 | 14 |
| 770.8712768554688 | 10 |
| 694.7921752929688 | 18 |
| 516.3160400390625 | 20 |
| 463.0831298828125 | 16 |
| 262.2209777832031 | 15 |
| 262.2209777832031 | 15 |
| 706.3038330078125 | 16 |
| 784.9130249023438 | 17 |
| 791.880126953125 | 16 |
| 372.71063232421875 | 15 |
| 529.8828125 | 16 |
| 770.8712768554688 | 22 |
| 750.7405395507812 | 13 |
| 463.0831298828125 | 16 |
| 199.46839904785156 | 22 |
| 199.46839904785156 | 23 |
| 303.8492126464844 | 21 |
| 274.2626037597656 | 25 |
| 292.9703063964844 | 20 |
| 284.289306640625 | 17 |
| 284.289306640625 | 22 |
| 632.6412353515625 | 17 |
| 626.6746215820312 | 17 |
| 525.9887084960938 | 15 |
| 525.9887084960938 | 14 |
| 571.5182495117188 | 15 |
| 655.1109008789062 | 20 |
| 632.0394897460938 | 14 |
| 630.723388671875 | 19 |
| 632.6412353515625 | 19 |
| 518.7465209960938 | 23 |
| 726.1697998046875 | 18 |
| 652.3453979492188 | 23 |
| 633.6226196289062 | 17 |
| 674.7698364257812 | 15 |
| 732.8759765625 | 16 |
| 525.1856689453125 | 18 |
| 590.1851806640625 | 20 |
| 561.3172607421875 | 17 |
| 519.164306640625 | 16 |
| 560.7740478515625 | 20 |
| 593.9766235351562 | 21 |
| 619.4428100585938 | 19 |
| 560.7740478515625 | 17 |
| 555.3790893554688 | 20 |
| 615.3169555664062 | 16 |
| 547.84423828125 | 15 |
| 560.7740478515625 | 14 |
| 625.3206176757812 | 16 |
| 559.748046875 | 16 |
| 508.96014404296875 | 18 |
| 625.5358276367188 | 18 |
| 197.36412048339844 | 15 |
| 739.6893920898438 | 18 |
| 626.0582275390625 | 18 |
| 738.970947265625 | 23 |
| 221.4526824951172 | 18 |
| 621.3438110351562 | 21 |
| 652.1843872070312 | 17 |
| 524.3838500976562 | 23 |
| 550.2875366210938 | 22 |
| 221.4526824951172 | 21 |
| 758.8510131835938 | 20 |
| 543.42626953125 | 19 |
| 561.8621215820312 | 25 |
| 758.8510131835938 | 13 |
| 758.8510131835938 | 18 |
| 595.9733276367188 | 15 |
| 551.9588012695312 | 21 |
| 758.8510131835938 | 19 |
| 231.72059631347656 | 19 |
| 565.6055908203125 | 16 |
| 194.8525390625 | 15 |
| 63.33378982543945 | 13 |
| 572.1602783203125 | 21 |
| 244.6024627685547 | 17 |
| 625.355712890625 | 21 |
| 523.6334228515625 | 21 |
| 164.41415405273438 | 18 |
| 231.72059631347656 | 15 |
| 617.7295532226562 | 18 |
| 405.9183349609375 | 14 |
| 63.33378982543945 | 14 |
| 610.8359375 | 17 |
| 248.73233032226562 | 19 |
| 515.2369384765625 | 16 |
| 610.8359375 | 14 |
| 524.3838500976562 | 14 |
| 214.28656005859375 | 17 |
| 523.6334228515625 | 14 |
| 597.816650390625 | 17 |
| 554.5656127929688 | 18 |
| 290.7442321777344 | 21 |
| 244.6024627685547 | 15 |
| 87.13106536865234 | 15 |
| 87.13106536865234 | 16 |
| 525.0402221679688 | 14 |
| 592.7514038085938 | 14 |
| 612.7474975585938 | 21 |
| 154.7660675048828 | 17 |
| 354.11322021484375 | 16 |
| 597.816650390625 | 18 |
| 555.3145141601562 | 17 |
| 244.6024627685547 | 12 |
| 231.72059631347656 | 12 |
| 636.1835327148438 | 24 |
| 636.1835327148438 | 23 |
| 304.6234130859375 | 24 |
| 334.9864196777344 | 24 |
| 306.8030090332031 | 28 |
| 314.4483947753906 | 21 |
| 314.4483947753906 | 23 |
| 186.07318115234375 | 22 |
| 163.7085418701172 | 20 |
| 103.6407241821289 | 20 |
| 103.6407241821289 | 17 |
| 115.26384735107422 | 17 |
| 166.24343872070312 | 14 |
| 191.37875366210938 | 18 |
| 185.4983673095703 | 20 |
| 186.07318115234375 | 17 |
| 86.08538818359375 | 19 |
| 175.31906127929688 | 18 |
| 87.3629150390625 | 22 |
| 64.53407287597656 | 17 |
| 178.83001708984375 | 15 |
| 276.2223205566406 | 22 |
| 75.24217224121094 | 22 |
| 71.65557861328125 | 15 |
| 42.64581298828125 | 19 |
| 82.50042724609375 | 17 |
| 101.3180923461914 | 18 |
| 71.83012390136719 | 20 |
| 24.693374633789062 | 20 |
| 101.3180923461914 | 14 |
| 47.534732818603516 | 21 |
| 26.270000457763672 | 18 |
| 56.94443893432617 | 21 |
| 101.3180923461914 | 17 |
| 90.44099426269531 | 16 |
| 44.75407791137695 | 19 |
| 118.75479125976562 | 20 |
| 44.89194869995117 | 23 |
| 400.6415710449219 | 18 |
| 268.3079528808594 | 20 |
| 183.28692626953125 | 21 |
| 211.330810546875 | 22 |
| 376.6054992675781 | 20 |
| 86.57146453857422 | 21 |
| 66.10514068603516 | 16 |
| 80.051025390625 | 25 |
| 116.85516357421875 | 24 |
| 376.6054992675781 | 20 |
| 203.7989501953125 | 21 |
| 90.19779968261719 | 19 |
| 41.965423583984375 | 18 |
| 203.7989501953125 | 16 |
| 203.7989501953125 | 16 |
| 57.301597595214844 | 20 |
| 82.26010131835938 | 20 |
| 203.7989501953125 | 15 |
| 770.8712768554688 | 18 |
| 39.37578201293945 | 13 |
| 495.1233825683594 | 16 |
| 547.8621215820312 | 20 |
| 31.526578903198242 | 18 |
| 587.1080932617188 | 21 |
| 29.141817092895508 | 22 |
| 81.07562255859375 | 21 |
| 568.0348510742188 | 20 |
| 770.8712768554688 | 16 |
| 50.44413375854492 | 20 |
| 194.84463500976562 | 17 |
| 547.8621215820312 | 16 |
| 70.8581314086914 | 17 |
| 419.2044982910156 | 21 |
| 86.256103515625 | 21 |
| 70.8581314086914 | 18 |
| 80.051025390625 | 18 |
| 389.4775390625 | 18 |
| 81.07562255859375 | 16 |
| 0.0 | 22 |
| 138.79454040527344 | 21 |
| 378.8355712890625 | 17 |
| 587.1080932617188 | 18 |
| 524.8143920898438 | 18 |
| 524.8143920898438 | 10 |
| 77.63041687011719 | 13 |
| 91.42475891113281 | 22 |
| 33.08108901977539 | 22 |
| 590.6536865234375 | 19 |
| 244.97413635253906 | 17 |
| 0.0 | 23 |
| 110.38435363769531 | 16 |
| 587.1080932617188 | 19 |
| 770.8712768554688 | 17 |
| 597.816650390625 | 18 |
| 214.5423583984375 | 22 |
| 214.5423583984375 | 23 |
| 216.1292724609375 | 25 |
| 202.70303344726562 | 26 |
| 243.1625213623047 | 25 |
| 247.45118713378906 | 19 |
| 247.45118713378906 | 23 |
| 407.4944763183594 | 19 |
| 411.87384033203125 | 14 |
| 366.4605407714844 | 18 |
| 366.4605407714844 | 16 |
| 385.4115905761719 | 16 |
| 441.3207702636719 | 20 |
| 404.3943786621094 | 20 |
| 405.7522888183594 | 18 |
| 407.4944763183594 | 16 |
| 423.1236877441406 | 22 |
| 525.5978393554688 | 18 |
| 480.7260437011719 | 22 |
| 471.1624450683594 | 17 |
| 457.7257995605469 | 15 |
| 482.14947509765625 | 21 |
| 397.24285888671875 | 21 |
| 423.5889587402344 | 20 |
| 425.43353271484375 | 18 |
| 389.401123046875 | 16 |
| 385.4556579589844 | 20 |
| 426.6781921386719 | 19 |
| 480.2185974121094 | 20 |
| 385.4556579589844 | 17 |
| 420.85858154296875 | 20 |
| 472.6426696777344 | 16 |
| 411.34674072265625 | 22 |
| 385.4556579589844 | 15 |
| 447.30511474609375 | 13 |
| 449.4310302734375 | 18 |
| 349.9691467285156 | 17 |
| 473.39276123046875 | 18 |
| 257.2992858886719 | 17 |
| 493.9899597167969 | 19 |
| 401.93792724609375 | 19 |
| 521.6063232421875 | 22 |
| 259.0986328125 | 16 |
| 445.14306640625 | 23 |
| 495.82489013671875 | 17 |
| 426.2113342285156 | 24 |
| 488.5171813964844 | 21 |
| 259.0986328125 | 24 |
| 554.5092163085938 | 16 |
| 463.71875 | 20 |
| 426.1158447265625 | 20 |
| 554.5092163085938 | 14 |
| 554.5092163085938 | 19 |
| 436.0321960449219 | 15 |
| 468.2652893066406 | 19 |
| 554.5092163085938 | 14 |
| 553.2034912109375 | 20 |
| 428.6854553222656 | 17 |
| 126.86692810058594 | 20 |
| 260.96734619140625 | 20 |
| 436.543701171875 | 19 |
| 142.11367797851562 | 21 |
| 496.5029602050781 | 19 |
| 426.1156311035156 | 19 |
| 177.45640563964844 | 19 |
| 553.2034912109375 | 15 |
| 460.83270263671875 | 18 |
| 344.08453369140625 | 17 |
| 260.96734619140625 | 16 |
| 442.70013427734375 | 17 |
| 107.37035369873047 | 20 |
| 415.1532287597656 | 21 |
| 442.70013427734375 | 15 |
| 426.2113342285156 | 15 |
| 209.9188232421875 | 16 |
| 426.1156311035156 | 20 |
| 468.0428161621094 | 19 |
| 505.76605224609375 | 20 |
| 111.55131530761719 | 25 |
| 142.11367797851562 | 16 |
| 321.0045166015625 | 18 |
| 321.0045166015625 | 16 |
| 392.89984130859375 | 15 |
| 415.3711242675781 | 19 |
| 465.2229919433594 | 23 |
| 200.439208984375 | 21 |
| 308.9976806640625 | 19 |
| 468.0428161621094 | 22 |
| 376.5721130371094 | 19 |
| 142.11367797851562 | 19 |
| 553.2034912109375 | 20 |
| 321.6101379394531 | 18 |
| 468.0428161621094 | 15 |
| 489.5685119628906 | 25 |
| 489.5685119628906 | 20 |
| 169.37667846679688 | 26 |
| 189.42616271972656 | 21 |
| 147.9219512939453 | 26 |
| 148.3409881591797 | 20 |
| 148.3409881591797 | 24 |
| 343.0954284667969 | 22 |
| 325.9338684082031 | 18 |
| 200.41712951660156 | 16 |
| 200.41712951660156 | 14 |
| 256.06231689453125 | 14 |
| 345.00579833984375 | 21 |
| 345.9395751953125 | 19 |
| 341.5508117675781 | 21 |
| 343.0954284667969 | 17 |
| 135.352783203125 | 24 |
| 386.64404296875 | 20 |
| 298.9437561035156 | 23 |
| 275.9588317871094 | 21 |
| 363.58233642578125 | 14 |
| 452.6164245605469 | 18 |
| 166.99461364746094 | 19 |
| 247.31553649902344 | 18 |
| 198.27468872070312 | 18 |
| 165.19076538085938 | 16 |
| 237.3960418701172 | 20 |
| 250.67564392089844 | 19 |
| 245.9491424560547 | 16 |
| 237.3960418701172 | 17 |
| 192.89146423339844 | 19 |
| 245.14813232421875 | 19 |
| 189.5424346923828 | 22 |
| 237.3960418701172 | 16 |
| 284.0755920410156 | 18 |
| 177.26087951660156 | 16 |
| 191.75454711914062 | 19 |
| 260.8453674316406 | 20 |
| 210.2155303955078 | 18 |
| 450.9124450683594 | 19 |
| 337.26971435546875 | 19 |
| 415.0007019042969 | 18 |
| 187.5628204345703 | 20 |
| 279.3182373046875 | 24 |
| 285.98486328125 | 13 |
| 141.38035583496094 | 19 |
| 148.95481872558594 | 18 |
| 187.5628204345703 | 21 |
| 418.02264404296875 | 21 |
| 147.00454711914062 | 20 |
| 198.5425567626953 | 16 |
| 418.02264404296875 | 14 |
| 418.02264404296875 | 17 |
| 245.00205993652344 | 22 |
| 156.24058532714844 | 16 |
| 418.02264404296875 | 18 |
| 553.4358520507812 | 14 |
| 202.24533081054688 | 14 |
| 354.53118896484375 | 18 |
| 362.5316162109375 | 19 |
| 205.9236602783203 | 18 |
| 461.9714050292969 | 14 |
| 243.92140197753906 | 17 |
| 140.35305786132812 | 19 |
| 417.24169921875 | 15 |
| 553.4358520507812 | 14 |
| 258.6591491699219 | 18 |
| 57.40297317504883 | 19 |
| 362.5316162109375 | 16 |
| 263.6814270019531 | 15 |
| 295.33990478515625 | 13 |
| 136.14093017578125 | 20 |
| 263.6814270019531 | 13 |
| 141.38035583496094 | 11 |
| 220.80824279785156 | 15 |
| 140.35305786132812 | 14 |
| 221.42848205566406 | 20 |
| 153.07748413085938 | 16 |
| 273.6640930175781 | 17 |
| 461.9714050292969 | 15 |
| 320.4284362792969 | 12 |
| 320.4284362792969 | 15 |
| 170.97787475585938 | 14 |
| 260.1507873535156 | 18 |
| 246.90386962890625 | 23 |
| 435.46868896484375 | 12 |
| 75.74940490722656 | 12 |
| 221.42848205566406 | 28 |
| 238.0489959716797 | 14 |
| 461.9714050292969 | 15 |
| 553.4358520507812 | 16 |
| 401.7581481933594 | 16 |
| 221.42848205566406 | 17 |
| 384.7126770019531 | 16 |
| 214.5423583984375 | 23 |
| 214.5423583984375 | 23 |
| 216.1292724609375 | 22 |
| 202.70303344726562 | 24 |
| 243.1625213623047 | 24 |
| 247.45118713378906 | 21 |
| 247.45118713378906 | 20 |
| 407.4944763183594 | 20 |
| 411.87384033203125 | 19 |
| 366.4605407714844 | 16 |
| 366.4605407714844 | 16 |
| 385.4115905761719 | 15 |
| 441.3207702636719 | 20 |
| 404.3943786621094 | 21 |
| 405.7522888183594 | 18 |
| 407.4944763183594 | 17 |
| 423.1236877441406 | 23 |
| 525.5978393554688 | 20 |
| 480.7260437011719 | 21 |
| 471.1624450683594 | 19 |
| 457.7257995605469 | 16 |
| 482.14947509765625 | 17 |
| 397.24285888671875 | 18 |
| 423.5889587402344 | 20 |
| 425.43353271484375 | 19 |
| 389.401123046875 | 17 |
| 385.4556579589844 | 19 |
| 426.6781921386719 | 17 |
| 480.2185974121094 | 17 |
| 385.4556579589844 | 15 |
| 420.85858154296875 | 20 |
| 472.6426696777344 | 18 |
| 411.34674072265625 | 18 |
| 385.4556579589844 | 15 |
| 447.30511474609375 | 19 |
| 449.4310302734375 | 16 |
| 349.9691467285156 | 17 |
| 473.39276123046875 | 18 |
| 257.2992858886719 | 17 |
| 493.9899597167969 | 19 |
| 401.93792724609375 | 14 |
| 521.6063232421875 | 21 |
| 259.0986328125 | 18 |
| 445.14306640625 | 23 |
| 495.82489013671875 | 16 |
| 426.2113342285156 | 23 |
| 488.5171813964844 | 21 |
| 259.0986328125 | 22 |
| 554.5092163085938 | 21 |
| 463.71875 | 19 |
| 426.1158447265625 | 17 |
| 554.5092163085938 | 13 |
| 554.5092163085938 | 20 |
| 436.0321960449219 | 20 |
| 468.2652893066406 | 20 |
| 554.5092163085938 | 17 |
| 553.2034912109375 | 16 |
| 428.6854553222656 | 17 |
| 126.86692810058594 | 19 |
| 260.96734619140625 | 18 |
| 436.543701171875 | 20 |
| 142.11367797851562 | 18 |
| 496.5029602050781 | 17 |
| 426.1156311035156 | 19 |
| 177.45640563964844 | 19 |
| 553.2034912109375 | 16 |
| 460.83270263671875 | 18 |
| 344.08453369140625 | 18 |
| 260.96734619140625 | 17 |
| 442.70013427734375 | 16 |
| 107.37035369873047 | 18 |
| 415.1532287597656 | 19 |
| 442.70013427734375 | 15 |
| 426.2113342285156 | 16 |
| 209.9188232421875 | 15 |
| 426.1156311035156 | 17 |
| 468.0428161621094 | 21 |
| 505.76605224609375 | 18 |
| 111.55131530761719 | 21 |
| 142.11367797851562 | 17 |
| 321.0045166015625 | 16 |
| 321.0045166015625 | 13 |
| 392.89984130859375 | 13 |
| 415.3711242675781 | 17 |
| 465.2229919433594 | 23 |
| 200.439208984375 | 16 |
| 308.9976806640625 | 15 |
| 468.0428161621094 | 27 |
| 376.5721130371094 | 16 |
| 142.11367797851562 | 16 |
| 553.2034912109375 | 17 |
| 321.6101379394531 | 14 |
| 468.0428161621094 | 14 |
| 0.0 | 15 |
| 384.7126770019531 | 11 |
| 76.77801513671875 | 26 |
| 76.77801513671875 | 23 |
| 298.4950866699219 | 25 |
| 273.6326599121094 | 24 |
| 314.3398742675781 | 26 |
| 313.6916198730469 | 19 |
| 313.6916198730469 | 21 |
| 546.3301391601562 | 19 |
| 549.1411743164062 | 20 |
| 489.9959716796875 | 18 |
| 489.9959716796875 | 15 |
| 516.3311157226562 | 14 |
| 578.8543701171875 | 21 |
| 543.5487670898438 | 20 |
| 544.5396728515625 | 20 |
| 546.3301391601562 | 19 |
| 530.2596435546875 | 23 |
| 662.0107421875 | 19 |
| 610.672607421875 | 19 |
| 598.7667236328125 | 18 |
| 595.978515625 | 17 |
| 624.0245971679688 | 21 |
| 513.08984375 | 21 |
| 550.9463500976562 | 21 |
| 544.7342529296875 | 21 |
| 505.42816162109375 | 18 |
| 513.8019409179688 | 19 |
| 554.2958984375 | 21 |
| 602.2024536132812 | 20 |
| 513.8019409179688 | 14 |
| 539.6016845703125 | 18 |
| 595.3198852539062 | 14 |
| 530.2798461914062 | 14 |
| 513.8019409179688 | 16 |
| 577.9583129882812 | 16 |
| 562.2415771484375 | 14 |
| 472.6312255859375 | 17 |
| 598.521240234375 | 16 |
| 279.7236022949219 | 15 |
| 635.633056640625 | 21 |
| 540.5479125976562 | 16 |
| 660.550048828125 | 22 |
| 293.18316650390625 | 21 |
| 575.3367309570312 | 24 |
| 622.5401611328125 | 16 |
| 534.2997436523438 | 16 |
| 587.7534790039062 | 21 |
| 293.18316650390625 | 22 |
| 691.8482055664062 | 22 |
| 567.669921875 | 19 |
| 545.4032592773438 | 24 |
| 691.8482055664062 | 14 |
| 691.8482055664062 | 17 |
| 562.09326171875 | 17 |
| 573.673828125 | 22 |
| 691.8482055664062 | 23 |
| 463.0831298828125 | 13 |
| 548.3956909179688 | 16 |
| 109.42603302001953 | 17 |
| 199.9594268798828 | 18 |
| 556.172119140625 | 19 |
| 0.0 | 14 |
| 616.171875 | 15 |
| 533.9937133789062 | 23 |
| 81.3782730102539 | 17 |
| 463.0831298828125 | 16 |
| 586.819091796875 | 18 |
| 434.3944091796875 | 20 |
| 199.9594268798828 | 14 |
| 570.9527587890625 | 16 |
| 171.26614379882812 | 18 |
| 523.3087768554688 | 17 |
| 570.9527587890625 | 18 |
| 534.2997436523438 | 17 |
| 247.1760711669922 | 18 |
| 533.9937133789062 | 19 |
| 587.1080932617188 | 17 |
| 601.46484375 | 16 |
| 208.33737182617188 | 22 |
| 0.0 | 15 |
| 281.8938903808594 | 15 |
| 281.8938903808594 | 20 |
| 509.7915344238281 | 15 |
| 545.09033203125 | 17 |
| 588.9527587890625 | 21 |
| 90.98236083984375 | 17 |
| 389.1873474121094 | 15 |
| 587.1080932617188 | 21 |
| 505.4725646972656 | 17 |
| 0.0 | 13 |
| 463.0831298828125 | 14 |
| 244.6024627685547 | 15 |
| 587.1080932617188 | 20 |
| 142.11367797851562 | 20 |
| 461.9714050292969 | 16 |
| 142.11367797851562 | 14 |
| 520.094482421875 | 31 |
| 520.094482421875 | 29 |
| 200.01751708984375 | 24 |
| 230.37855529785156 | 24 |
| 211.4513397216797 | 24 |
| 221.19732666015625 | 27 |
| 221.19732666015625 | 28 |
| 156.18167114257812 | 23 |
| 140.86349487304688 | 24 |
| 23.459531784057617 | 21 |
| 23.459531784057617 | 21 |
| 73.22455596923828 | 20 |
| 163.8255157470703 | 16 |
| 158.6192169189453 | 21 |
| 154.545166015625 | 24 |
| 156.18167114257812 | 21 |
| 105.56341552734375 | 24 |
| 224.22840881347656 | 22 |
| 150.4983367919922 | 19 |
| 134.30686950683594 | 25 |
| 183.49549865722656 | 23 |
| 266.4399108886719 | 27 |
| 59.94676971435547 | 25 |
| 87.99799346923828 | 27 |
| 80.77812194824219 | 25 |
| 52.98872756958008 | 21 |
| 58.57648849487305 | 22 |
| 91.72439575195312 | 17 |
| 135.3213348388672 | 22 |
| 58.57648849487305 | 21 |
| 76.74555969238281 | 23 |
| 128.1144561767578 | 24 |
| 67.30216979980469 | 26 |
| 58.57648849487305 | 19 |
| 122.2047348022461 | 22 |
| 112.8692398071289 | 25 |
| 5.844033718109131 | 25 |
| 131.52378845214844 | 24 |
| 310.93328857421875 | 21 |
| 266.2900085449219 | 23 |
| 150.11289978027344 | 25 |
| 242.6706085205078 | 26 |
| 288.0412902832031 | 26 |
| 118.27937316894531 | 24 |
| 156.50424194335938 | 21 |
| 104.99344635009766 | 28 |
| 179.168701171875 | 26 |
| 288.0412902832031 | 29 |
| 257.0575866699219 | 28 |
| 146.3649444580078 | 27 |
| 81.45942687988281 | 15 |
| 257.0575866699219 | 21 |
| 257.0575866699219 | 20 |
| 96.4285659790039 | 21 |
| 146.3451690673828 | 22 |
| 257.0575866699219 | 23 |
| 696.0341186523438 | 15 |
| 83.75210571289062 | 23 |
| 380.18115234375 | 21 |
| 448.06964111328125 | 26 |
| 91.58193969726562 | 26 |
| 467.3707275390625 | 22 |
| 151.29769897460938 | 22 |
| 105.54576873779297 | 25 |
| 454.14239501953125 | 19 |
| 696.0341186523438 | 18 |
| 120.57716369628906 | 23 |
| 136.4051971435547 | 24 |
| 448.06964111328125 | 20 |
| 108.8397216796875 | 19 |
| 302.66119384765625 | 25 |
| 96.58063507080078 | 24 |
| 108.8397216796875 | 22 |
| 104.99344635009766 | 22 |
| 289.2331848144531 | 23 |
| 105.54576873779297 | 25 |
| 123.10006713867188 | 20 |
| 202.61143493652344 | 23 |
| 260.0777893066406 | 23 |
| 467.3707275390625 | 21 |
| 438.8130798339844 | 22 |
| 438.8130798339844 | 18 |
| 53.65446090698242 | 21 |
| 89.79340362548828 | 26 |
| 121.5850601196289 | 14 |
| 477.5938720703125 | 20 |
| 170.7378692626953 | 21 |
| 123.10006713867188 | 32 |
| 55.11631774902344 | 22 |
| 467.3707275390625 | 19 |
| 696.0341186523438 | 20 |
| 503.1237487792969 | 24 |
| 123.10006713867188 | 17 |
| 345.24603271484375 | 21 |
| 188.00473022460938 | 17 |
| 345.24603271484375 | 19 |
| 467.3707275390625 | 17 |
| 672.4252319335938 | 25 |
| 672.4252319335938 | 23 |
| 338.21087646484375 | 24 |
| 368.17340087890625 | 24 |
| 337.4661560058594 | 24 |
| 344.3190612792969 | 17 |
| 344.3190612792969 | 20 |
| 220.41627502441406 | 22 |
| 198.09930419921875 | 20 |
| 146.12509155273438 | 18 |
| 146.12509155273438 | 16 |
| 156.27908325195312 | 15 |
| 195.94418334960938 | 13 |
| 225.98719787597656 | 21 |
| 220.0763702392578 | 17 |
| 220.41627502441406 | 13 |
| 106.68599700927734 | 25 |
| 187.55076599121094 | 16 |
| 107.49613189697266 | 22 |
| 89.0691909790039 | 19 |
| 205.67950439453125 | 14 |
| 301.8962707519531 | 20 |
| 112.3508071899414 | 19 |
| 111.1417236328125 | 21 |
| 84.01319122314453 | 17 |
| 120.0849838256836 | 16 |
| 143.48719787597656 | 19 |
| 110.57025146484375 | 21 |
| 46.012908935546875 | 15 |
| 143.48719787597656 | 14 |
| 88.1197280883789 | 20 |
| 54.29730224609375 | 21 |
| 97.62865447998047 | 21 |
| 143.48719787597656 | 19 |
| 121.6043930053711 | 16 |
| 66.056640625 | 15 |
| 160.69384765625 | 14 |
| 69.69860076904297 | 18 |
| 428.032470703125 | 16 |
| 292.1239013671875 | 20 |
| 218.40115356445312 | 15 |
| 227.46502685546875 | 18 |
| 403.9453125 | 20 |
| 118.66278839111328 | 26 |
| 77.53726196289062 | 17 |
| 100.98242950439453 | 19 |
| 108.0655746459961 | 23 |
| 403.9453125 | 21 |
| 211.89047241210938 | 16 |
| 92.19434356689453 | 20 |
| 83.33403015136719 | 23 |
| 211.89047241210938 | 16 |
| 211.89047241210938 | 17 |
| 95.93247985839844 | 21 |
| 82.7808837890625 | 17 |
| 211.89047241210938 | 19 |
| 790.1704711914062 | 16 |
| 81.28256225585938 | 15 |
| 531.1796875 | 20 |
| 577.5890502929688 | 19 |
| 73.60440063476562 | 12 |
| 625.3641967773438 | 17 |
| 23.861825942993164 | 16 |
| 101.7522964477539 | 19 |
| 603.399169921875 | 15 |
| 790.1704711914062 | 15 |
| 81.11910247802734 | 15 |
| 219.55755615234375 | 20 |
| 577.5890502929688 | 16 |
| 105.37249755859375 | 16 |
| 456.2493896484375 | 18 |
| 110.22814178466797 | 20 |
| 105.37249755859375 | 15 |
| 100.98242950439453 | 17 |
| 420.5722961425781 | 19 |
| 101.7522964477539 | 18 |
| 42.871055603027344 | 19 |
| 125.29373931884766 | 17 |
| 417.0490417480469 | 24 |
| 625.3641967773438 | 18 |
| 549.6573486328125 | 19 |
| 549.6573486328125 | 20 |
| 116.07972717285156 | 15 |
| 130.09947204589844 | 16 |
| 64.67656707763672 | 21 |
| 625.5824584960938 | 19 |
| 271.23681640625 | 18 |
| 42.871055603027344 | 28 |
| 152.70791625976562 | 14 |
| 625.3641967773438 | 21 |
| 790.1704711914062 | 17 |
| 625.3499755859375 | 22 |
| 42.871055603027344 | 18 |
| 508.7109680175781 | 18 |
| 236.94261169433594 | 16 |
| 508.7109680175781 | 19 |
| 625.3641967773438 | 18 |
| 164.76473999023438 | 24 |
| 76.77801513671875 | 23 |
| 76.77801513671875 | 26 |
| 298.4950866699219 | 27 |
| 273.6326599121094 | 28 |
| 314.3398742675781 | 30 |
| 313.6916198730469 | 26 |
| 313.6916198730469 | 27 |
| 546.3301391601562 | 25 |
| 549.1411743164062 | 23 |
| 489.9959716796875 | 18 |
| 489.9959716796875 | 17 |
| 516.3311157226562 | 17 |
| 578.8543701171875 | 18 |
| 543.5487670898438 | 17 |
| 544.5396728515625 | 24 |
| 546.3301391601562 | 22 |
| 530.2596435546875 | 23 |
| 662.0107421875 | 17 |
| 610.672607421875 | 21 |
| 598.7667236328125 | 19 |
| 595.978515625 | 18 |
| 624.0245971679688 | 21 |
| 513.08984375 | 24 |
| 550.9463500976562 | 20 |
| 544.7342529296875 | 19 |
| 505.42816162109375 | 19 |
| 513.8019409179688 | 20 |
| 554.2958984375 | 22 |
| 602.2024536132812 | 21 |
| 513.8019409179688 | 17 |
| 539.6016845703125 | 21 |
| 595.3198852539062 | 19 |
| 530.2798461914062 | 24 |
| 513.8019409179688 | 18 |
| 577.9583129882812 | 21 |
| 562.2415771484375 | 22 |
| 472.6312255859375 | 19 |
| 598.521240234375 | 21 |
| 279.7236022949219 | 18 |
| 635.633056640625 | 21 |
| 540.5479125976562 | 22 |
| 660.550048828125 | 24 |
| 293.18316650390625 | 18 |
| 575.3367309570312 | 22 |
| 622.5401611328125 | 15 |
| 534.2997436523438 | 25 |
| 587.7534790039062 | 23 |
| 293.18316650390625 | 25 |
| 691.8482055664062 | 24 |
| 567.669921875 | 21 |
| 545.4032592773438 | 24 |
| 691.8482055664062 | 15 |
| 691.8482055664062 | 14 |
| 562.09326171875 | 18 |
| 573.673828125 | 22 |
| 691.8482055664062 | 25 |
| 463.0831298828125 | 19 |
| 548.3956909179688 | 19 |
| 109.42603302001953 | 21 |
| 199.9594268798828 | 19 |
| 556.172119140625 | 23 |
| 0.0 | 22 |
| 616.171875 | 23 |
| 533.9937133789062 | 21 |
| 81.3782730102539 | 18 |
| 463.0831298828125 | 15 |
| 586.819091796875 | 22 |
| 434.3944091796875 | 15 |
| 199.9594268798828 | 18 |
| 570.9527587890625 | 19 |
| 171.26614379882812 | 24 |
| 523.3087768554688 | 18 |
| 570.9527587890625 | 20 |
| 534.2997436523438 | 17 |
| 247.1760711669922 | 20 |
| 533.9937133789062 | 21 |
| 587.1080932617188 | 22 |
| 601.46484375 | 18 |
| 208.33737182617188 | 21 |
| 0.0 | 19 |
| 281.8938903808594 | 17 |
| 281.8938903808594 | 15 |
| 509.7915344238281 | 19 |
| 545.09033203125 | 16 |
| 588.9527587890625 | 24 |
| 90.98236083984375 | 18 |
| 389.1873474121094 | 17 |
| 587.1080932617188 | 24 |
| 505.4725646972656 | 19 |
| 0.0 | 17 |
| 463.0831298828125 | 15 |
| 244.6024627685547 | 16 |
| 587.1080932617188 | 16 |
| 142.11367797851562 | 21 |
| 461.9714050292969 | 20 |
| 142.11367797851562 | 20 |
| 0.0 | 18 |
| 467.3707275390625 | 19 |
| 625.3641967773438 | 23 |
| 257.09222412109375 | 21 |
| 257.09222412109375 | 19 |
| 245.47183227539062 | 24 |
| 218.82200622558594 | 29 |
| 227.70071411132812 | 25 |
| 217.66969299316406 | 19 |
| 217.66969299316406 | 20 |
| 577.7900390625 | 18 |
| 569.4641723632812 | 20 |
| 460.8735046386719 | 19 |
| 460.8735046386719 | 16 |
| 509.8411560058594 | 18 |
| 596.7805786132812 | 20 |
| 577.8465576171875 | 18 |
| 575.8897705078125 | 24 |
| 577.7900390625 | 20 |
| 443.06634521484375 | 20 |
| 663.0411987304688 | 21 |
| 585.1202392578125 | 22 |
| 565.1952514648438 | 21 |
| 616.6654052734375 | 13 |
| 682.3575439453125 | 22 |
| 454.3518371582031 | 23 |
| 523.87548828125 | 18 |
| 490.46539306640625 | 22 |
| 448.8932800292969 | 16 |
| 497.2877502441406 | 20 |
| 527.6727905273438 | 25 |
| 547.3709106445312 | 20 |
| 497.2877502441406 | 19 |
| 484.5059509277344 | 20 |
| 543.929443359375 | 20 |
| 477.5853271484375 | 21 |
| 497.2877502441406 | 15 |
| 560.108642578125 | 21 |
| 484.876953125 | 16 |
| 444.5672607421875 | 21 |
| 555.4857788085938 | 25 |
| 127.95233917236328 | 18 |
| 687.538330078125 | 23 |
| 571.16259765625 | 20 |
| 679.391845703125 | 16 |
| 150.84703063964844 | 18 |
| 555.8931884765625 | 21 |
| 582.1719360351562 | 16 |
| 448.8777160644531 | 19 |
| 469.3831787109375 | 22 |
| 150.84703063964844 | 23 |
| 695.8706665039062 | 22 |
| 464.81280517578125 | 15 |
| 490.96795654296875 | 24 |
| 695.8706665039062 | 17 |
| 695.8706665039062 | 17 |
| 528.2146606445312 | 17 |
| 473.6229248046875 | 18 |
| 695.8706665039062 | 19 |
| 262.2209777832031 | 16 |
| 494.7811584472656 | 21 |
| 200.0485382080078 | 19 |
| 85.1433334350586 | 19 |
| 500.89532470703125 | 22 |
| 281.8938903808594 | 21 |
| 551.4816284179688 | 22 |
| 448.05780029296875 | 17 |
| 201.9900665283203 | 19 |
| 262.2209777832031 | 18 |
| 548.744140625 | 18 |
| 330.4931640625 | 13 |
| 85.1433334350586 | 15 |
| 544.1439819335938 | 21 |
| 227.3341827392578 | 19 |
| 440.3420104980469 | 20 |
| 544.1439819335938 | 21 |
| 448.8777160644531 | 20 |
| 159.97335815429688 | 19 |
| 448.05780029296875 | 19 |
| 524.8143920898438 | 23 |
| 472.2297668457031 | 22 |
| 260.84356689453125 | 19 |
| 281.8938903808594 | 22 |
| 0.0 | 14 |
| 0.0 | 20 |
| 454.93182373046875 | 15 |
| 528.4751586914062 | 25 |
| 542.2562866210938 | 23 |
| 202.62432861328125 | 17 |
| 279.8504333496094 | 18 |
| 524.8143920898438 | 23 |
| 492.757080078125 | 19 |
| 281.8938903808594 | 16 |
| 262.2209777832031 | 15 |
| 87.13106536865234 | 16 |
| 524.8143920898438 | 20 |
| 321.0045166015625 | 21 |
| 320.4284362792969 | 18 |
| 321.0045166015625 | 20 |
| 281.8938903808594 | 21 |
| 438.8130798339844 | 26 |
| 549.6573486328125 | 21 |
| 281.8938903808594 | 21 |
| 636.033935546875 | 23 |
| 636.033935546875 | 22 |
| 348.72149658203125 | 23 |
| 377.2874450683594 | 26 |
| 366.42291259765625 | 23 |
| 376.9420166015625 | 23 |
| 376.9420166015625 | 23 |
| 30.28519630432129 | 22 |
| 24.452409744262695 | 16 |
| 145.60736083984375 | 20 |
| 145.60736083984375 | 19 |
| 89.84889221191406 | 18 |
| 8.140800476074219 | 21 |
| 35.4672737121582 | 16 |
| 31.497655868530273 | 21 |
| 30.28519630432129 | 18 |
| 228.5135955810547 | 23 |
| 92.8026351928711 | 20 |
| 98.60836791992188 | 22 |
| 112.67706298828125 | 16 |
| 24.054563522338867 | 19 |
| 109.4504623413086 | 21 |
| 182.20655822753906 | 18 |
| 106.34976196289062 | 19 |
| 161.59097290039062 | 20 |
| 182.0041961669922 | 13 |
| 107.88016510009766 | 20 |
| 104.24040222167969 | 22 |
| 156.04837036132812 | 19 |
| 107.88016510009766 | 16 |
| 164.82606506347656 | 17 |
| 148.6705780029297 | 18 |
| 163.68447875976562 | 16 |
| 107.88016510009766 | 20 |
| 80.59877014160156 | 19 |
| 203.0187530517578 | 17 |
| 157.45179748535156 | 19 |
| 131.850341796875 | 16 |
| 465.9058532714844 | 19 |
| 105.84841918945312 | 17 |
| 34.06166458129883 | 18 |
| 89.43741607666016 | 19 |
| 444.14813232421875 | 16 |
| 84.23458099365234 | 17 |
| 130.47274780273438 | 15 |
| 224.12718200683594 | 18 |
| 283.9463806152344 | 21 |
| 444.14813232421875 | 18 |
| 120.00926208496094 | 17 |
| 252.89891052246094 | 20 |
| 161.7105255126953 | 27 |
| 120.00926208496094 | 17 |
| 120.00926208496094 | 18 |
| 116.41443634033203 | 19 |
| 247.05003356933594 | 18 |
| 120.00926208496094 | 22 |
| 853.6585693359375 | 18 |
| 159.23660278320312 | 19 |
| 503.70025634765625 | 21 |
| 592.37451171875 | 18 |
| 160.49415588378906 | 17 |
| 572.4533081054688 | 18 |
| 177.66226196289062 | 21 |
| 225.1769256591797 | 19 |
| 577.431884765625 | 16 |
| 853.6585693359375 | 15 |
| 121.51170349121094 | 19 |
| 297.517578125 | 16 |
| 592.37451171875 | 18 |
| 100.10256958007812 | 19 |
| 426.05010986328125 | 17 |
| 222.62417602539062 | 17 |
| 100.10256958007812 | 18 |
| 224.12718200683594 | 16 |
| 437.5670471191406 | 20 |
| 225.1769256591797 | 13 |
| 170.76284790039062 | 14 |
| 307.2616271972656 | 21 |
| 379.8736572265625 | 25 |
| 572.4533081054688 | 19 |
| 593.4691162109375 | 21 |
| 593.4691162109375 | 22 |
| 176.84555053710938 | 20 |
| 88.54469299316406 | 20 |
| 139.0498504638672 | 22 |
| 602.0059204101562 | 21 |
| 332.9795837402344 | 19 |
| 170.76284790039062 | 26 |
| 108.17888641357422 | 19 |
| 572.4533081054688 | 22 |
| 853.6585693359375 | 16 |
| 651.0411987304688 | 19 |
| 170.76284790039062 | 23 |
| 434.5833435058594 | 17 |
| 345.22845458984375 | 19 |
| 434.5833435058594 | 22 |
| 572.4533081054688 | 21 |
| 162.43646240234375 | 26 |
| 201.522216796875 | 19 |
| 572.4533081054688 | 24 |
| 593.4691162109375 | 23 |